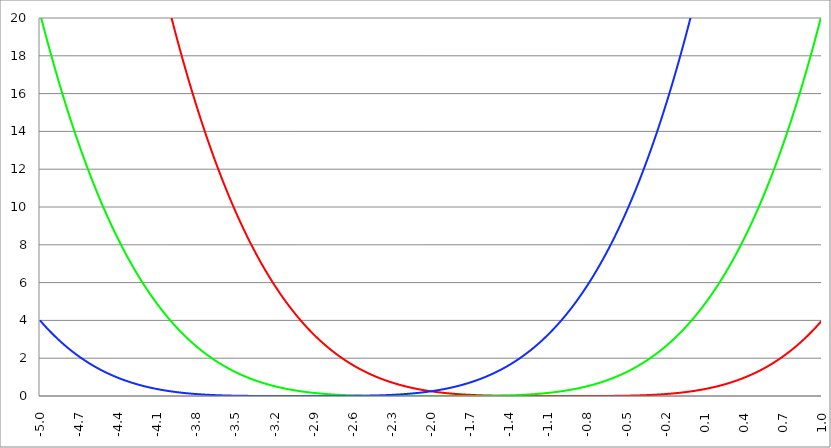
| Category | Series 1 | Series 0 | Series 2 |
|---|---|---|---|
| -5.0 | 64 | 20.25 | 4 |
| -4.997 | 63.808 | 20.169 | 3.976 |
| -4.994 | 63.617 | 20.088 | 3.952 |
| -4.991 | 63.426 | 20.008 | 3.928 |
| -4.988 | 63.235 | 19.928 | 3.905 |
| -4.984999999999999 | 63.045 | 19.848 | 3.881 |
| -4.982 | 62.856 | 19.768 | 3.858 |
| -4.979 | 62.667 | 19.689 | 3.835 |
| -4.976 | 62.478 | 19.61 | 3.811 |
| -4.972999999999999 | 62.289 | 19.531 | 3.788 |
| -4.969999999999999 | 62.101 | 19.452 | 3.765 |
| -4.966999999999999 | 61.914 | 19.374 | 3.742 |
| -4.963999999999999 | 61.727 | 19.295 | 3.72 |
| -4.960999999999998 | 61.54 | 19.217 | 3.697 |
| -4.957999999999998 | 61.354 | 19.14 | 3.674 |
| -4.954999999999998 | 61.168 | 19.062 | 3.652 |
| -4.951999999999998 | 60.983 | 18.985 | 3.63 |
| -4.948999999999998 | 60.798 | 18.908 | 3.607 |
| -4.945999999999998 | 60.613 | 18.831 | 3.585 |
| -4.942999999999998 | 60.429 | 18.754 | 3.563 |
| -4.939999999999997 | 60.246 | 18.678 | 3.541 |
| -4.936999999999997 | 60.062 | 18.602 | 3.519 |
| -4.933999999999997 | 59.879 | 18.526 | 3.498 |
| -4.930999999999997 | 59.697 | 18.45 | 3.476 |
| -4.927999999999997 | 59.515 | 18.375 | 3.454 |
| -4.924999999999997 | 59.333 | 18.3 | 3.433 |
| -4.921999999999997 | 59.152 | 18.225 | 3.412 |
| -4.918999999999997 | 58.971 | 18.15 | 3.39 |
| -4.915999999999997 | 58.791 | 18.075 | 3.369 |
| -4.912999999999997 | 58.611 | 18.001 | 3.348 |
| -4.909999999999996 | 58.432 | 17.927 | 3.327 |
| -4.906999999999996 | 58.252 | 17.853 | 3.306 |
| -4.903999999999996 | 58.074 | 17.78 | 3.286 |
| -4.900999999999996 | 57.895 | 17.706 | 3.265 |
| -4.897999999999996 | 57.717 | 17.633 | 3.244 |
| -4.894999999999996 | 57.54 | 17.56 | 3.224 |
| -4.891999999999996 | 57.363 | 17.488 | 3.203 |
| -4.888999999999996 | 57.186 | 17.415 | 3.183 |
| -4.885999999999996 | 57.01 | 17.343 | 3.163 |
| -4.882999999999996 | 56.834 | 17.271 | 3.143 |
| -4.879999999999995 | 56.659 | 17.199 | 3.123 |
| -4.876999999999995 | 56.484 | 17.128 | 3.103 |
| -4.873999999999995 | 56.309 | 17.056 | 3.083 |
| -4.870999999999995 | 56.135 | 16.985 | 3.064 |
| -4.867999999999995 | 55.961 | 16.914 | 3.044 |
| -4.864999999999995 | 55.788 | 16.844 | 3.025 |
| -4.861999999999995 | 55.615 | 16.773 | 3.005 |
| -4.858999999999995 | 55.442 | 16.703 | 2.986 |
| -4.855999999999994 | 55.27 | 16.633 | 2.967 |
| -4.852999999999994 | 55.098 | 16.563 | 2.947 |
| -4.849999999999994 | 54.927 | 16.494 | 2.928 |
| -4.846999999999994 | 54.756 | 16.424 | 2.909 |
| -4.843999999999994 | 54.585 | 16.355 | 2.891 |
| -4.840999999999994 | 54.415 | 16.286 | 2.872 |
| -4.837999999999994 | 54.245 | 16.218 | 2.853 |
| -4.834999999999994 | 54.076 | 16.149 | 2.835 |
| -4.831999999999994 | 53.907 | 16.081 | 2.816 |
| -4.828999999999993 | 53.738 | 16.013 | 2.798 |
| -4.825999999999993 | 53.57 | 15.945 | 2.779 |
| -4.822999999999993 | 53.402 | 15.878 | 2.761 |
| -4.819999999999993 | 53.235 | 15.81 | 2.743 |
| -4.816999999999993 | 53.068 | 15.743 | 2.725 |
| -4.813999999999993 | 52.901 | 15.676 | 2.707 |
| -4.810999999999993 | 52.735 | 15.609 | 2.689 |
| -4.807999999999993 | 52.569 | 15.543 | 2.671 |
| -4.804999999999993 | 52.403 | 15.476 | 2.654 |
| -4.801999999999992 | 52.238 | 15.41 | 2.636 |
| -4.798999999999992 | 52.074 | 15.344 | 2.619 |
| -4.795999999999992 | 51.909 | 15.279 | 2.601 |
| -4.792999999999992 | 51.745 | 15.213 | 2.584 |
| -4.789999999999992 | 51.582 | 15.148 | 2.567 |
| -4.786999999999992 | 51.419 | 15.083 | 2.549 |
| -4.783999999999992 | 51.256 | 15.018 | 2.532 |
| -4.780999999999992 | 51.094 | 14.954 | 2.515 |
| -4.777999999999992 | 50.932 | 14.889 | 2.498 |
| -4.774999999999991 | 50.77 | 14.825 | 2.482 |
| -4.771999999999991 | 50.609 | 14.761 | 2.465 |
| -4.768999999999991 | 50.448 | 14.697 | 2.448 |
| -4.765999999999991 | 50.288 | 14.634 | 2.432 |
| -4.762999999999991 | 50.128 | 14.57 | 2.415 |
| -4.759999999999991 | 49.968 | 14.507 | 2.399 |
| -4.756999999999991 | 49.809 | 14.444 | 2.382 |
| -4.753999999999991 | 49.65 | 14.381 | 2.366 |
| -4.75099999999999 | 49.491 | 14.319 | 2.35 |
| -4.74799999999999 | 49.333 | 14.256 | 2.334 |
| -4.74499999999999 | 49.175 | 14.194 | 2.318 |
| -4.74199999999999 | 49.018 | 14.132 | 2.302 |
| -4.73899999999999 | 48.861 | 14.07 | 2.286 |
| -4.73599999999999 | 48.704 | 14.009 | 2.271 |
| -4.73299999999999 | 48.548 | 13.948 | 2.255 |
| -4.72999999999999 | 48.392 | 13.886 | 2.239 |
| -4.72699999999999 | 48.237 | 13.825 | 2.224 |
| -4.723999999999989 | 48.082 | 13.765 | 2.208 |
| -4.720999999999989 | 47.927 | 13.704 | 2.193 |
| -4.717999999999989 | 47.772 | 13.644 | 2.178 |
| -4.714999999999989 | 47.618 | 13.584 | 2.163 |
| -4.71199999999999 | 47.465 | 13.524 | 2.148 |
| -4.708999999999989 | 47.312 | 13.464 | 2.133 |
| -4.705999999999989 | 47.159 | 13.405 | 2.118 |
| -4.702999999999989 | 47.006 | 13.345 | 2.103 |
| -4.699999999999989 | 46.854 | 13.286 | 2.088 |
| -4.696999999999988 | 46.702 | 13.227 | 2.073 |
| -4.693999999999988 | 46.551 | 13.168 | 2.059 |
| -4.690999999999988 | 46.4 | 13.11 | 2.044 |
| -4.687999999999988 | 46.249 | 13.051 | 2.03 |
| -4.684999999999988 | 46.099 | 12.993 | 2.015 |
| -4.681999999999988 | 45.949 | 12.935 | 2.001 |
| -4.678999999999988 | 45.799 | 12.877 | 1.987 |
| -4.675999999999988 | 45.65 | 12.82 | 1.973 |
| -4.672999999999988 | 45.501 | 12.763 | 1.959 |
| -4.669999999999987 | 45.353 | 12.705 | 1.944 |
| -4.666999999999987 | 45.205 | 12.648 | 1.931 |
| -4.663999999999987 | 45.057 | 12.591 | 1.917 |
| -4.660999999999987 | 44.91 | 12.535 | 1.903 |
| -4.657999999999987 | 44.763 | 12.478 | 1.889 |
| -4.654999999999987 | 44.616 | 12.422 | 1.876 |
| -4.651999999999987 | 44.47 | 12.366 | 1.862 |
| -4.648999999999987 | 44.324 | 12.31 | 1.849 |
| -4.645999999999986 | 44.178 | 12.255 | 1.835 |
| -4.642999999999986 | 44.033 | 12.199 | 1.822 |
| -4.639999999999986 | 43.888 | 12.144 | 1.808 |
| -4.636999999999986 | 43.743 | 12.089 | 1.795 |
| -4.633999999999986 | 43.599 | 12.034 | 1.782 |
| -4.630999999999986 | 43.456 | 11.979 | 1.769 |
| -4.627999999999986 | 43.312 | 11.925 | 1.756 |
| -4.624999999999986 | 43.169 | 11.87 | 1.743 |
| -4.621999999999986 | 43.026 | 11.816 | 1.73 |
| -4.618999999999985 | 42.884 | 11.762 | 1.718 |
| -4.615999999999985 | 42.742 | 11.708 | 1.705 |
| -4.612999999999985 | 42.6 | 11.655 | 1.692 |
| -4.609999999999985 | 42.459 | 11.601 | 1.68 |
| -4.606999999999985 | 42.318 | 11.548 | 1.667 |
| -4.603999999999985 | 42.177 | 11.495 | 1.655 |
| -4.600999999999985 | 42.037 | 11.442 | 1.642 |
| -4.597999999999985 | 41.897 | 11.389 | 1.63 |
| -4.594999999999985 | 41.758 | 11.337 | 1.618 |
| -4.591999999999984 | 41.618 | 11.284 | 1.606 |
| -4.588999999999984 | 41.48 | 11.232 | 1.594 |
| -4.585999999999984 | 41.341 | 11.18 | 1.582 |
| -4.582999999999984 | 41.203 | 11.129 | 1.57 |
| -4.579999999999984 | 41.065 | 11.077 | 1.558 |
| -4.576999999999984 | 40.928 | 11.025 | 1.546 |
| -4.573999999999984 | 40.79 | 10.974 | 1.534 |
| -4.570999999999984 | 40.654 | 10.923 | 1.523 |
| -4.567999999999984 | 40.517 | 10.872 | 1.511 |
| -4.564999999999984 | 40.381 | 10.822 | 1.5 |
| -4.561999999999983 | 40.245 | 10.771 | 1.488 |
| -4.558999999999983 | 40.11 | 10.721 | 1.477 |
| -4.555999999999983 | 39.975 | 10.67 | 1.465 |
| -4.552999999999983 | 39.84 | 10.62 | 1.454 |
| -4.549999999999983 | 39.706 | 10.571 | 1.443 |
| -4.546999999999983 | 39.572 | 10.521 | 1.432 |
| -4.543999999999983 | 39.438 | 10.471 | 1.421 |
| -4.540999999999983 | 39.305 | 10.422 | 1.41 |
| -4.537999999999982 | 39.172 | 10.373 | 1.399 |
| -4.534999999999982 | 39.039 | 10.324 | 1.388 |
| -4.531999999999982 | 38.907 | 10.275 | 1.377 |
| -4.528999999999982 | 38.775 | 10.227 | 1.366 |
| -4.525999999999982 | 38.643 | 10.178 | 1.356 |
| -4.522999999999982 | 38.512 | 10.13 | 1.345 |
| -4.519999999999982 | 38.381 | 10.082 | 1.334 |
| -4.516999999999982 | 38.25 | 10.034 | 1.324 |
| -4.513999999999982 | 38.119 | 9.986 | 1.314 |
| -4.510999999999981 | 37.989 | 9.939 | 1.303 |
| -4.507999999999981 | 37.86 | 9.891 | 1.293 |
| -4.504999999999981 | 37.73 | 9.844 | 1.283 |
| -4.501999999999981 | 37.601 | 9.797 | 1.272 |
| -4.498999999999981 | 37.473 | 9.75 | 1.262 |
| -4.495999999999981 | 37.344 | 9.703 | 1.252 |
| -4.492999999999981 | 37.216 | 9.657 | 1.242 |
| -4.48999999999998 | 37.089 | 9.61 | 1.232 |
| -4.48699999999998 | 36.961 | 9.564 | 1.222 |
| -4.48399999999998 | 36.834 | 9.518 | 1.212 |
| -4.48099999999998 | 36.708 | 9.472 | 1.203 |
| -4.47799999999998 | 36.581 | 9.426 | 1.193 |
| -4.47499999999998 | 36.455 | 9.381 | 1.183 |
| -4.47199999999998 | 36.329 | 9.335 | 1.174 |
| -4.46899999999998 | 36.204 | 9.29 | 1.164 |
| -4.46599999999998 | 36.079 | 9.245 | 1.155 |
| -4.46299999999998 | 35.954 | 9.2 | 1.145 |
| -4.45999999999998 | 35.83 | 9.155 | 1.136 |
| -4.45699999999998 | 35.706 | 9.111 | 1.127 |
| -4.45399999999998 | 35.582 | 9.066 | 1.117 |
| -4.45099999999998 | 35.458 | 9.022 | 1.108 |
| -4.44799999999998 | 35.335 | 8.978 | 1.099 |
| -4.444999999999979 | 35.213 | 8.934 | 1.09 |
| -4.441999999999978 | 35.09 | 8.89 | 1.081 |
| -4.438999999999978 | 34.968 | 8.847 | 1.072 |
| -4.435999999999978 | 34.846 | 8.803 | 1.063 |
| -4.432999999999978 | 34.724 | 8.76 | 1.054 |
| -4.429999999999978 | 34.603 | 8.717 | 1.045 |
| -4.426999999999978 | 34.482 | 8.674 | 1.037 |
| -4.423999999999978 | 34.362 | 8.631 | 1.028 |
| -4.420999999999978 | 34.241 | 8.589 | 1.019 |
| -4.417999999999978 | 34.122 | 8.546 | 1.011 |
| -4.414999999999978 | 34.002 | 8.504 | 1.002 |
| -4.411999999999977 | 33.883 | 8.462 | 0.994 |
| -4.408999999999977 | 33.764 | 8.42 | 0.985 |
| -4.405999999999977 | 33.645 | 8.378 | 0.977 |
| -4.402999999999977 | 33.526 | 8.336 | 0.969 |
| -4.399999999999977 | 33.408 | 8.294 | 0.96 |
| -4.396999999999977 | 33.291 | 8.253 | 0.952 |
| -4.393999999999977 | 33.173 | 8.212 | 0.944 |
| -4.390999999999977 | 33.056 | 8.171 | 0.936 |
| -4.387999999999977 | 32.939 | 8.13 | 0.928 |
| -4.384999999999977 | 32.823 | 8.089 | 0.92 |
| -4.381999999999976 | 32.707 | 8.048 | 0.912 |
| -4.378999999999976 | 32.591 | 8.008 | 0.904 |
| -4.375999999999976 | 32.475 | 7.968 | 0.896 |
| -4.372999999999976 | 32.36 | 7.927 | 0.888 |
| -4.369999999999976 | 32.245 | 7.887 | 0.881 |
| -4.366999999999976 | 32.13 | 7.848 | 0.873 |
| -4.363999999999976 | 32.016 | 7.808 | 0.865 |
| -4.360999999999976 | 31.902 | 7.768 | 0.858 |
| -4.357999999999976 | 31.788 | 7.729 | 0.85 |
| -4.354999999999976 | 31.675 | 7.69 | 0.843 |
| -4.351999999999975 | 31.561 | 7.65 | 0.835 |
| -4.348999999999975 | 31.449 | 7.612 | 0.828 |
| -4.345999999999975 | 31.336 | 7.573 | 0.821 |
| -4.342999999999975 | 31.224 | 7.534 | 0.813 |
| -4.339999999999974 | 31.112 | 7.496 | 0.806 |
| -4.336999999999974 | 31 | 7.457 | 0.799 |
| -4.333999999999974 | 30.889 | 7.419 | 0.792 |
| -4.330999999999974 | 30.778 | 7.381 | 0.785 |
| -4.327999999999974 | 30.667 | 7.343 | 0.778 |
| -4.324999999999974 | 30.557 | 7.305 | 0.771 |
| -4.321999999999974 | 30.447 | 7.268 | 0.764 |
| -4.318999999999974 | 30.337 | 7.23 | 0.757 |
| -4.315999999999974 | 30.227 | 7.193 | 0.75 |
| -4.312999999999974 | 30.118 | 7.156 | 0.743 |
| -4.309999999999974 | 30.009 | 7.118 | 0.736 |
| -4.306999999999974 | 29.9 | 7.082 | 0.73 |
| -4.303999999999974 | 29.792 | 7.045 | 0.723 |
| -4.300999999999973 | 29.684 | 7.008 | 0.716 |
| -4.297999999999973 | 29.576 | 6.972 | 0.71 |
| -4.294999999999973 | 29.469 | 6.935 | 0.703 |
| -4.291999999999973 | 29.362 | 6.899 | 0.697 |
| -4.288999999999973 | 29.255 | 6.863 | 0.69 |
| -4.285999999999973 | 29.148 | 6.827 | 0.684 |
| -4.282999999999973 | 29.042 | 6.791 | 0.677 |
| -4.279999999999972 | 28.936 | 6.756 | 0.671 |
| -4.276999999999972 | 28.83 | 6.72 | 0.665 |
| -4.273999999999972 | 28.725 | 6.685 | 0.659 |
| -4.270999999999972 | 28.62 | 6.65 | 0.652 |
| -4.267999999999972 | 28.515 | 6.615 | 0.646 |
| -4.264999999999972 | 28.41 | 6.58 | 0.64 |
| -4.261999999999972 | 28.306 | 6.545 | 0.634 |
| -4.258999999999972 | 28.202 | 6.51 | 0.628 |
| -4.255999999999972 | 28.098 | 6.476 | 0.622 |
| -4.252999999999972 | 27.995 | 6.441 | 0.616 |
| -4.249999999999971 | 27.892 | 6.407 | 0.61 |
| -4.246999999999971 | 27.789 | 6.373 | 0.605 |
| -4.243999999999971 | 27.686 | 6.339 | 0.599 |
| -4.240999999999971 | 27.584 | 6.305 | 0.593 |
| -4.237999999999971 | 27.482 | 6.272 | 0.587 |
| -4.234999999999971 | 27.38 | 6.238 | 0.582 |
| -4.23199999999997 | 27.279 | 6.205 | 0.576 |
| -4.228999999999971 | 27.178 | 6.171 | 0.57 |
| -4.225999999999971 | 27.077 | 6.138 | 0.565 |
| -4.222999999999971 | 26.976 | 6.105 | 0.559 |
| -4.21999999999997 | 26.876 | 6.072 | 0.554 |
| -4.21699999999997 | 26.776 | 6.04 | 0.548 |
| -4.21399999999997 | 26.676 | 6.007 | 0.543 |
| -4.21099999999997 | 26.577 | 5.974 | 0.538 |
| -4.20799999999997 | 26.478 | 5.942 | 0.532 |
| -4.20499999999997 | 26.379 | 5.91 | 0.527 |
| -4.20199999999997 | 26.28 | 5.878 | 0.522 |
| -4.19899999999997 | 26.182 | 5.846 | 0.517 |
| -4.19599999999997 | 26.084 | 5.814 | 0.512 |
| -4.192999999999969 | 25.986 | 5.782 | 0.506 |
| -4.18999999999997 | 25.888 | 5.751 | 0.501 |
| -4.18699999999997 | 25.791 | 5.719 | 0.496 |
| -4.18399999999997 | 25.694 | 5.688 | 0.491 |
| -4.180999999999969 | 25.597 | 5.657 | 0.486 |
| -4.177999999999969 | 25.501 | 5.626 | 0.481 |
| -4.174999999999969 | 25.405 | 5.595 | 0.477 |
| -4.171999999999968 | 25.309 | 5.564 | 0.472 |
| -4.168999999999968 | 25.213 | 5.533 | 0.467 |
| -4.165999999999968 | 25.118 | 5.503 | 0.462 |
| -4.162999999999968 | 25.023 | 5.472 | 0.457 |
| -4.159999999999968 | 24.928 | 5.442 | 0.453 |
| -4.156999999999968 | 24.834 | 5.412 | 0.448 |
| -4.153999999999968 | 24.739 | 5.382 | 0.443 |
| -4.150999999999968 | 24.645 | 5.352 | 0.439 |
| -4.147999999999968 | 24.552 | 5.322 | 0.434 |
| -4.144999999999968 | 24.458 | 5.292 | 0.43 |
| -4.141999999999967 | 24.365 | 5.263 | 0.425 |
| -4.138999999999967 | 24.272 | 5.233 | 0.421 |
| -4.135999999999967 | 24.179 | 5.204 | 0.416 |
| -4.132999999999967 | 24.087 | 5.175 | 0.412 |
| -4.129999999999967 | 23.995 | 5.146 | 0.408 |
| -4.126999999999967 | 23.903 | 5.117 | 0.403 |
| -4.123999999999967 | 23.811 | 5.088 | 0.399 |
| -4.120999999999967 | 23.72 | 5.059 | 0.395 |
| -4.117999999999967 | 23.629 | 5.031 | 0.391 |
| -4.114999999999966 | 23.538 | 5.002 | 0.386 |
| -4.111999999999966 | 23.448 | 4.974 | 0.382 |
| -4.108999999999966 | 23.357 | 4.946 | 0.378 |
| -4.105999999999966 | 23.267 | 4.918 | 0.374 |
| -4.102999999999966 | 23.178 | 4.89 | 0.37 |
| -4.099999999999965 | 23.088 | 4.862 | 0.366 |
| -4.096999999999965 | 22.999 | 4.834 | 0.362 |
| -4.093999999999965 | 22.91 | 4.807 | 0.358 |
| -4.090999999999965 | 22.821 | 4.779 | 0.354 |
| -4.087999999999965 | 22.733 | 4.752 | 0.35 |
| -4.084999999999965 | 22.644 | 4.725 | 0.346 |
| -4.081999999999965 | 22.556 | 4.697 | 0.343 |
| -4.078999999999965 | 22.469 | 4.67 | 0.339 |
| -4.075999999999964 | 22.381 | 4.644 | 0.335 |
| -4.072999999999964 | 22.294 | 4.617 | 0.331 |
| -4.069999999999964 | 22.207 | 4.59 | 0.328 |
| -4.066999999999964 | 22.121 | 4.564 | 0.324 |
| -4.063999999999964 | 22.034 | 4.537 | 0.32 |
| -4.060999999999964 | 21.948 | 4.511 | 0.317 |
| -4.057999999999964 | 21.862 | 4.485 | 0.313 |
| -4.054999999999964 | 21.776 | 4.458 | 0.31 |
| -4.051999999999964 | 21.691 | 4.433 | 0.306 |
| -4.048999999999964 | 21.606 | 4.407 | 0.303 |
| -4.045999999999964 | 21.521 | 4.381 | 0.299 |
| -4.042999999999964 | 21.436 | 4.355 | 0.296 |
| -4.039999999999963 | 21.352 | 4.33 | 0.292 |
| -4.036999999999963 | 21.268 | 4.304 | 0.289 |
| -4.033999999999963 | 21.184 | 4.279 | 0.286 |
| -4.030999999999963 | 21.1 | 4.254 | 0.282 |
| -4.027999999999963 | 21.017 | 4.229 | 0.279 |
| -4.024999999999963 | 20.933 | 4.204 | 0.276 |
| -4.021999999999963 | 20.851 | 4.179 | 0.273 |
| -4.018999999999963 | 20.768 | 4.154 | 0.27 |
| -4.015999999999963 | 20.685 | 4.13 | 0.266 |
| -4.012999999999963 | 20.603 | 4.105 | 0.263 |
| -4.009999999999962 | 20.521 | 4.081 | 0.26 |
| -4.006999999999962 | 20.44 | 4.056 | 0.257 |
| -4.003999999999962 | 20.358 | 4.032 | 0.254 |
| -4.000999999999962 | 20.277 | 4.008 | 0.251 |
| -3.997999999999962 | 20.196 | 3.984 | 0.248 |
| -3.994999999999962 | 20.115 | 3.96 | 0.245 |
| -3.991999999999962 | 20.035 | 3.936 | 0.242 |
| -3.988999999999962 | 19.955 | 3.913 | 0.239 |
| -3.985999999999962 | 19.875 | 3.889 | 0.236 |
| -3.982999999999961 | 19.795 | 3.866 | 0.233 |
| -3.979999999999961 | 19.715 | 3.842 | 0.231 |
| -3.976999999999961 | 19.636 | 3.819 | 0.228 |
| -3.973999999999961 | 19.557 | 3.796 | 0.225 |
| -3.970999999999961 | 19.478 | 3.773 | 0.222 |
| -3.967999999999961 | 19.4 | 3.75 | 0.22 |
| -3.964999999999961 | 19.321 | 3.727 | 0.217 |
| -3.961999999999961 | 19.243 | 3.705 | 0.214 |
| -3.958999999999961 | 19.165 | 3.682 | 0.211 |
| -3.95599999999996 | 19.088 | 3.659 | 0.209 |
| -3.95299999999996 | 19.011 | 3.637 | 0.206 |
| -3.94999999999996 | 18.933 | 3.615 | 0.204 |
| -3.94699999999996 | 18.856 | 3.593 | 0.201 |
| -3.94399999999996 | 18.78 | 3.57 | 0.199 |
| -3.94099999999996 | 18.703 | 3.548 | 0.196 |
| -3.93799999999996 | 18.627 | 3.527 | 0.194 |
| -3.93499999999996 | 18.551 | 3.505 | 0.191 |
| -3.931999999999959 | 18.475 | 3.483 | 0.189 |
| -3.928999999999959 | 18.4 | 3.462 | 0.186 |
| -3.925999999999959 | 18.325 | 3.44 | 0.184 |
| -3.922999999999959 | 18.25 | 3.419 | 0.181 |
| -3.919999999999959 | 18.175 | 3.397 | 0.179 |
| -3.916999999999959 | 18.1 | 3.376 | 0.177 |
| -3.913999999999959 | 18.026 | 3.355 | 0.174 |
| -3.910999999999959 | 17.952 | 3.334 | 0.172 |
| -3.907999999999959 | 17.878 | 3.313 | 0.17 |
| -3.904999999999958 | 17.804 | 3.292 | 0.168 |
| -3.901999999999958 | 17.731 | 3.272 | 0.165 |
| -3.898999999999958 | 17.658 | 3.251 | 0.163 |
| -3.895999999999958 | 17.585 | 3.231 | 0.161 |
| -3.892999999999958 | 17.512 | 3.21 | 0.159 |
| -3.889999999999958 | 17.439 | 3.19 | 0.157 |
| -3.886999999999958 | 17.367 | 3.17 | 0.155 |
| -3.883999999999958 | 17.295 | 3.15 | 0.153 |
| -3.880999999999958 | 17.223 | 3.13 | 0.151 |
| -3.877999999999957 | 17.152 | 3.11 | 0.149 |
| -3.874999999999957 | 17.08 | 3.09 | 0.147 |
| -3.871999999999957 | 17.009 | 3.07 | 0.145 |
| -3.868999999999957 | 16.938 | 3.051 | 0.143 |
| -3.865999999999957 | 16.867 | 3.031 | 0.141 |
| -3.862999999999957 | 16.797 | 3.012 | 0.139 |
| -3.859999999999957 | 16.726 | 2.992 | 0.137 |
| -3.856999999999957 | 16.656 | 2.973 | 0.135 |
| -3.853999999999957 | 16.587 | 2.954 | 0.133 |
| -3.850999999999956 | 16.517 | 2.935 | 0.131 |
| -3.847999999999956 | 16.448 | 2.916 | 0.129 |
| -3.844999999999956 | 16.378 | 2.897 | 0.127 |
| -3.841999999999956 | 16.309 | 2.878 | 0.126 |
| -3.838999999999956 | 16.241 | 2.859 | 0.124 |
| -3.835999999999956 | 16.172 | 2.841 | 0.122 |
| -3.832999999999956 | 16.104 | 2.822 | 0.12 |
| -3.829999999999956 | 16.036 | 2.804 | 0.119 |
| -3.826999999999955 | 15.968 | 2.785 | 0.117 |
| -3.823999999999955 | 15.9 | 2.767 | 0.115 |
| -3.820999999999955 | 15.833 | 2.749 | 0.114 |
| -3.817999999999955 | 15.765 | 2.731 | 0.112 |
| -3.814999999999955 | 15.698 | 2.713 | 0.11 |
| -3.811999999999955 | 15.632 | 2.695 | 0.109 |
| -3.808999999999955 | 15.565 | 2.677 | 0.107 |
| -3.805999999999955 | 15.499 | 2.66 | 0.106 |
| -3.802999999999955 | 15.432 | 2.642 | 0.104 |
| -3.799999999999954 | 15.366 | 2.624 | 0.102 |
| -3.796999999999954 | 15.301 | 2.607 | 0.101 |
| -3.793999999999954 | 15.235 | 2.59 | 0.099 |
| -3.790999999999954 | 15.17 | 2.572 | 0.098 |
| -3.787999999999954 | 15.105 | 2.555 | 0.096 |
| -3.784999999999954 | 15.04 | 2.538 | 0.095 |
| -3.781999999999954 | 14.975 | 2.521 | 0.093 |
| -3.778999999999954 | 14.911 | 2.504 | 0.092 |
| -3.775999999999954 | 14.846 | 2.487 | 0.091 |
| -3.772999999999953 | 14.782 | 2.47 | 0.089 |
| -3.769999999999953 | 14.718 | 2.454 | 0.088 |
| -3.766999999999953 | 14.655 | 2.437 | 0.087 |
| -3.763999999999953 | 14.591 | 2.421 | 0.085 |
| -3.760999999999953 | 14.528 | 2.404 | 0.084 |
| -3.757999999999953 | 14.465 | 2.388 | 0.083 |
| -3.754999999999953 | 14.402 | 2.372 | 0.081 |
| -3.751999999999953 | 14.339 | 2.355 | 0.08 |
| -3.748999999999952 | 14.277 | 2.339 | 0.079 |
| -3.745999999999952 | 14.215 | 2.323 | 0.077 |
| -3.742999999999952 | 14.153 | 2.307 | 0.076 |
| -3.739999999999952 | 14.091 | 2.292 | 0.075 |
| -3.736999999999952 | 14.029 | 2.276 | 0.074 |
| -3.733999999999952 | 13.968 | 2.26 | 0.073 |
| -3.730999999999952 | 13.907 | 2.245 | 0.071 |
| -3.727999999999952 | 13.846 | 2.229 | 0.07 |
| -3.724999999999952 | 13.785 | 2.214 | 0.069 |
| -3.721999999999951 | 13.724 | 2.198 | 0.068 |
| -3.718999999999951 | 13.664 | 2.183 | 0.067 |
| -3.715999999999951 | 13.604 | 2.168 | 0.066 |
| -3.712999999999951 | 13.544 | 2.153 | 0.065 |
| -3.709999999999951 | 13.484 | 2.138 | 0.064 |
| -3.706999999999951 | 13.424 | 2.123 | 0.062 |
| -3.703999999999951 | 13.365 | 2.108 | 0.061 |
| -3.700999999999951 | 13.306 | 2.093 | 0.06 |
| -3.697999999999951 | 13.247 | 2.078 | 0.059 |
| -3.69499999999995 | 13.188 | 2.064 | 0.058 |
| -3.69199999999995 | 13.129 | 2.049 | 0.057 |
| -3.68899999999995 | 13.071 | 2.035 | 0.056 |
| -3.68599999999995 | 13.013 | 2.02 | 0.055 |
| -3.68299999999995 | 12.955 | 2.006 | 0.054 |
| -3.67999999999995 | 12.897 | 1.991 | 0.053 |
| -3.67699999999995 | 12.839 | 1.977 | 0.053 |
| -3.67399999999995 | 12.782 | 1.963 | 0.052 |
| -3.67099999999995 | 12.724 | 1.949 | 0.051 |
| -3.667999999999949 | 12.667 | 1.935 | 0.05 |
| -3.664999999999949 | 12.61 | 1.921 | 0.049 |
| -3.661999999999949 | 12.554 | 1.907 | 0.048 |
| -3.658999999999949 | 12.497 | 1.894 | 0.047 |
| -3.655999999999949 | 12.441 | 1.88 | 0.046 |
| -3.652999999999949 | 12.385 | 1.867 | 0.045 |
| -3.649999999999949 | 12.329 | 1.853 | 0.045 |
| -3.646999999999949 | 12.273 | 1.84 | 0.044 |
| -3.643999999999949 | 12.218 | 1.826 | 0.043 |
| -3.640999999999948 | 12.162 | 1.813 | 0.042 |
| -3.637999999999948 | 12.107 | 1.8 | 0.041 |
| -3.634999999999948 | 12.052 | 1.787 | 0.041 |
| -3.631999999999948 | 11.997 | 1.773 | 0.04 |
| -3.628999999999948 | 11.943 | 1.76 | 0.039 |
| -3.625999999999948 | 11.888 | 1.748 | 0.038 |
| -3.622999999999948 | 11.834 | 1.735 | 0.038 |
| -3.619999999999948 | 11.78 | 1.722 | 0.037 |
| -3.616999999999947 | 11.726 | 1.709 | 0.036 |
| -3.613999999999947 | 11.672 | 1.697 | 0.036 |
| -3.610999999999947 | 11.619 | 1.684 | 0.035 |
| -3.607999999999947 | 11.566 | 1.671 | 0.034 |
| -3.604999999999947 | 11.513 | 1.659 | 0.033 |
| -3.601999999999947 | 11.46 | 1.647 | 0.033 |
| -3.598999999999947 | 11.407 | 1.634 | 0.032 |
| -3.595999999999947 | 11.354 | 1.622 | 0.032 |
| -3.592999999999947 | 11.302 | 1.61 | 0.031 |
| -3.589999999999947 | 11.25 | 1.598 | 0.03 |
| -3.586999999999946 | 11.198 | 1.586 | 0.03 |
| -3.583999999999946 | 11.146 | 1.574 | 0.029 |
| -3.580999999999946 | 11.094 | 1.562 | 0.028 |
| -3.577999999999946 | 11.043 | 1.55 | 0.028 |
| -3.574999999999946 | 10.991 | 1.538 | 0.027 |
| -3.571999999999946 | 10.94 | 1.527 | 0.027 |
| -3.568999999999946 | 10.889 | 1.515 | 0.026 |
| -3.565999999999946 | 10.838 | 1.504 | 0.026 |
| -3.562999999999946 | 10.788 | 1.492 | 0.025 |
| -3.559999999999945 | 10.737 | 1.481 | 0.025 |
| -3.556999999999945 | 10.687 | 1.469 | 0.024 |
| -3.553999999999945 | 10.637 | 1.458 | 0.024 |
| -3.550999999999945 | 10.587 | 1.447 | 0.023 |
| -3.547999999999945 | 10.538 | 1.436 | 0.023 |
| -3.544999999999945 | 10.488 | 1.424 | 0.022 |
| -3.541999999999945 | 10.439 | 1.413 | 0.022 |
| -3.538999999999945 | 10.389 | 1.402 | 0.021 |
| -3.535999999999945 | 10.34 | 1.392 | 0.021 |
| -3.532999999999944 | 10.292 | 1.381 | 0.02 |
| -3.529999999999944 | 10.243 | 1.37 | 0.02 |
| -3.526999999999944 | 10.194 | 1.359 | 0.019 |
| -3.523999999999944 | 10.146 | 1.349 | 0.019 |
| -3.520999999999944 | 10.098 | 1.338 | 0.018 |
| -3.517999999999944 | 10.05 | 1.327 | 0.018 |
| -3.514999999999944 | 10.002 | 1.317 | 0.018 |
| -3.511999999999944 | 9.954 | 1.307 | 0.017 |
| -3.508999999999943 | 9.907 | 1.296 | 0.017 |
| -3.505999999999943 | 9.86 | 1.286 | 0.016 |
| -3.502999999999943 | 9.813 | 1.276 | 0.016 |
| -3.499999999999943 | 9.766 | 1.266 | 0.016 |
| -3.496999999999943 | 9.719 | 1.256 | 0.015 |
| -3.493999999999943 | 9.672 | 1.245 | 0.015 |
| -3.490999999999943 | 9.626 | 1.236 | 0.015 |
| -3.487999999999943 | 9.579 | 1.226 | 0.014 |
| -3.484999999999943 | 9.533 | 1.216 | 0.014 |
| -3.481999999999942 | 9.487 | 1.206 | 0.013 |
| -3.478999999999942 | 9.442 | 1.196 | 0.013 |
| -3.475999999999942 | 9.396 | 1.187 | 0.013 |
| -3.472999999999942 | 9.351 | 1.177 | 0.013 |
| -3.469999999999942 | 9.305 | 1.167 | 0.012 |
| -3.466999999999942 | 9.26 | 1.158 | 0.012 |
| -3.463999999999942 | 9.215 | 1.148 | 0.012 |
| -3.460999999999942 | 9.17 | 1.139 | 0.011 |
| -3.457999999999942 | 9.126 | 1.13 | 0.011 |
| -3.454999999999941 | 9.081 | 1.12 | 0.011 |
| -3.451999999999941 | 9.037 | 1.111 | 0.01 |
| -3.448999999999941 | 8.993 | 1.102 | 0.01 |
| -3.445999999999941 | 8.949 | 1.093 | 0.01 |
| -3.442999999999941 | 8.905 | 1.084 | 0.01 |
| -3.439999999999941 | 8.861 | 1.075 | 0.009 |
| -3.436999999999941 | 8.818 | 1.066 | 0.009 |
| -3.433999999999941 | 8.774 | 1.057 | 0.009 |
| -3.430999999999941 | 8.731 | 1.048 | 0.009 |
| -3.42799999999994 | 8.688 | 1.04 | 0.008 |
| -3.42499999999994 | 8.645 | 1.031 | 0.008 |
| -3.42199999999994 | 8.603 | 1.022 | 0.008 |
| -3.41899999999994 | 8.56 | 1.014 | 0.008 |
| -3.41599999999994 | 8.518 | 1.005 | 0.007 |
| -3.41299999999994 | 8.476 | 0.997 | 0.007 |
| -3.40999999999994 | 8.434 | 0.988 | 0.007 |
| -3.40699999999994 | 8.392 | 0.98 | 0.007 |
| -3.403999999999939 | 8.35 | 0.971 | 0.007 |
| -3.400999999999939 | 8.308 | 0.963 | 0.006 |
| -3.397999999999939 | 8.267 | 0.955 | 0.006 |
| -3.394999999999939 | 8.225 | 0.947 | 0.006 |
| -3.391999999999939 | 8.184 | 0.939 | 0.006 |
| -3.388999999999939 | 8.143 | 0.931 | 0.006 |
| -3.385999999999939 | 8.103 | 0.923 | 0.006 |
| -3.382999999999939 | 8.062 | 0.915 | 0.005 |
| -3.379999999999939 | 8.021 | 0.907 | 0.005 |
| -3.376999999999938 | 7.981 | 0.899 | 0.005 |
| -3.373999999999938 | 7.941 | 0.891 | 0.005 |
| -3.370999999999938 | 7.901 | 0.883 | 0.005 |
| -3.367999999999938 | 7.861 | 0.876 | 0.005 |
| -3.364999999999938 | 7.821 | 0.868 | 0.004 |
| -3.361999999999938 | 7.781 | 0.86 | 0.004 |
| -3.358999999999938 | 7.742 | 0.853 | 0.004 |
| -3.355999999999938 | 7.703 | 0.845 | 0.004 |
| -3.352999999999938 | 7.664 | 0.838 | 0.004 |
| -3.349999999999937 | 7.625 | 0.83 | 0.004 |
| -3.346999999999937 | 7.586 | 0.823 | 0.004 |
| -3.343999999999937 | 7.547 | 0.816 | 0.004 |
| -3.340999999999937 | 7.508 | 0.808 | 0.003 |
| -3.337999999999937 | 7.47 | 0.801 | 0.003 |
| -3.334999999999937 | 7.432 | 0.794 | 0.003 |
| -3.331999999999937 | 7.394 | 0.787 | 0.003 |
| -3.328999999999937 | 7.356 | 0.78 | 0.003 |
| -3.325999999999937 | 7.318 | 0.773 | 0.003 |
| -3.322999999999936 | 7.28 | 0.766 | 0.003 |
| -3.319999999999936 | 7.243 | 0.759 | 0.003 |
| -3.316999999999936 | 7.205 | 0.752 | 0.003 |
| -3.313999999999936 | 7.168 | 0.745 | 0.002 |
| -3.310999999999936 | 7.131 | 0.739 | 0.002 |
| -3.307999999999936 | 7.094 | 0.732 | 0.002 |
| -3.304999999999936 | 7.057 | 0.725 | 0.002 |
| -3.301999999999936 | 7.02 | 0.718 | 0.002 |
| -3.298999999999936 | 6.984 | 0.712 | 0.002 |
| -3.295999999999935 | 6.947 | 0.705 | 0.002 |
| -3.292999999999935 | 6.911 | 0.699 | 0.002 |
| -3.289999999999935 | 6.875 | 0.692 | 0.002 |
| -3.286999999999935 | 6.839 | 0.686 | 0.002 |
| -3.283999999999935 | 6.803 | 0.68 | 0.002 |
| -3.280999999999935 | 6.768 | 0.673 | 0.002 |
| -3.277999999999935 | 6.732 | 0.667 | 0.001 |
| -3.274999999999935 | 6.697 | 0.661 | 0.001 |
| -3.271999999999934 | 6.662 | 0.654 | 0.001 |
| -3.268999999999934 | 6.626 | 0.648 | 0.001 |
| -3.265999999999934 | 6.591 | 0.642 | 0.001 |
| -3.262999999999934 | 6.557 | 0.636 | 0.001 |
| -3.259999999999934 | 6.522 | 0.63 | 0.001 |
| -3.256999999999934 | 6.487 | 0.624 | 0.001 |
| -3.253999999999934 | 6.453 | 0.618 | 0.001 |
| -3.250999999999934 | 6.419 | 0.612 | 0.001 |
| -3.247999999999933 | 6.384 | 0.606 | 0.001 |
| -3.244999999999933 | 6.35 | 0.601 | 0.001 |
| -3.241999999999933 | 6.317 | 0.595 | 0.001 |
| -3.238999999999933 | 6.283 | 0.589 | 0.001 |
| -3.235999999999933 | 6.249 | 0.583 | 0.001 |
| -3.232999999999933 | 6.216 | 0.578 | 0.001 |
| -3.229999999999933 | 6.182 | 0.572 | 0.001 |
| -3.226999999999933 | 6.149 | 0.567 | 0.001 |
| -3.223999999999932 | 6.116 | 0.561 | 0.001 |
| -3.220999999999932 | 6.083 | 0.556 | 0.001 |
| -3.217999999999932 | 6.05 | 0.55 | 0.001 |
| -3.214999999999932 | 6.018 | 0.545 | 0.001 |
| -3.211999999999932 | 5.985 | 0.539 | 0.001 |
| -3.208999999999932 | 5.953 | 0.534 | 0 |
| -3.205999999999932 | 5.921 | 0.529 | 0 |
| -3.202999999999932 | 5.888 | 0.524 | 0 |
| -3.199999999999932 | 5.856 | 0.518 | 0 |
| -3.196999999999932 | 5.825 | 0.513 | 0 |
| -3.193999999999932 | 5.793 | 0.508 | 0 |
| -3.190999999999931 | 5.761 | 0.503 | 0 |
| -3.187999999999931 | 5.73 | 0.498 | 0 |
| -3.184999999999931 | 5.698 | 0.493 | 0 |
| -3.181999999999931 | 5.667 | 0.488 | 0 |
| -3.178999999999931 | 5.636 | 0.483 | 0 |
| -3.175999999999931 | 5.605 | 0.478 | 0 |
| -3.172999999999931 | 5.574 | 0.473 | 0 |
| -3.169999999999931 | 5.543 | 0.468 | 0 |
| -3.166999999999931 | 5.513 | 0.464 | 0 |
| -3.16399999999993 | 5.482 | 0.459 | 0 |
| -3.16099999999993 | 5.452 | 0.454 | 0 |
| -3.15799999999993 | 5.422 | 0.45 | 0 |
| -3.15499999999993 | 5.392 | 0.445 | 0 |
| -3.15199999999993 | 5.362 | 0.44 | 0 |
| -3.14899999999993 | 5.332 | 0.436 | 0 |
| -3.14599999999993 | 5.302 | 0.431 | 0 |
| -3.14299999999993 | 5.273 | 0.427 | 0 |
| -3.139999999999929 | 5.243 | 0.422 | 0 |
| -3.136999999999929 | 5.214 | 0.418 | 0 |
| -3.133999999999929 | 5.185 | 0.413 | 0 |
| -3.130999999999929 | 5.156 | 0.409 | 0 |
| -3.12799999999993 | 5.127 | 0.405 | 0 |
| -3.124999999999929 | 5.098 | 0.4 | 0 |
| -3.121999999999929 | 5.069 | 0.396 | 0 |
| -3.118999999999929 | 5.04 | 0.392 | 0 |
| -3.115999999999929 | 5.012 | 0.388 | 0 |
| -3.112999999999928 | 4.984 | 0.384 | 0 |
| -3.109999999999928 | 4.955 | 0.38 | 0 |
| -3.106999999999928 | 4.927 | 0.375 | 0 |
| -3.103999999999928 | 4.899 | 0.371 | 0 |
| -3.100999999999928 | 4.871 | 0.367 | 0 |
| -3.097999999999928 | 4.844 | 0.363 | 0 |
| -3.094999999999928 | 4.816 | 0.359 | 0 |
| -3.091999999999928 | 4.788 | 0.355 | 0 |
| -3.088999999999928 | 4.761 | 0.352 | 0 |
| -3.085999999999927 | 4.734 | 0.348 | 0 |
| -3.082999999999927 | 4.706 | 0.344 | 0 |
| -3.079999999999927 | 4.679 | 0.34 | 0 |
| -3.076999999999927 | 4.652 | 0.336 | 0 |
| -3.073999999999927 | 4.626 | 0.333 | 0 |
| -3.070999999999927 | 4.599 | 0.329 | 0 |
| -3.067999999999927 | 4.572 | 0.325 | 0 |
| -3.064999999999927 | 4.546 | 0.322 | 0 |
| -3.061999999999927 | 4.52 | 0.318 | 0 |
| -3.058999999999926 | 4.493 | 0.314 | 0 |
| -3.055999999999926 | 4.467 | 0.311 | 0 |
| -3.052999999999926 | 4.441 | 0.307 | 0 |
| -3.049999999999926 | 4.415 | 0.304 | 0 |
| -3.046999999999926 | 4.389 | 0.3 | 0 |
| -3.043999999999926 | 4.364 | 0.297 | 0 |
| -3.040999999999926 | 4.338 | 0.294 | 0 |
| -3.037999999999926 | 4.313 | 0.29 | 0 |
| -3.034999999999926 | 4.287 | 0.287 | 0 |
| -3.031999999999925 | 4.262 | 0.284 | 0 |
| -3.028999999999925 | 4.237 | 0.28 | 0 |
| -3.025999999999925 | 4.212 | 0.277 | 0 |
| -3.022999999999925 | 4.187 | 0.274 | 0 |
| -3.019999999999925 | 4.162 | 0.271 | 0 |
| -3.016999999999925 | 4.138 | 0.267 | 0 |
| -3.013999999999925 | 4.113 | 0.264 | 0 |
| -3.010999999999925 | 4.089 | 0.261 | 0 |
| -3.007999999999925 | 4.064 | 0.258 | 0 |
| -3.004999999999924 | 4.04 | 0.255 | 0 |
| -3.001999999999924 | 4.016 | 0.252 | 0 |
| -2.998999999999924 | 3.992 | 0.249 | 0 |
| -2.995999999999924 | 3.968 | 0.246 | 0 |
| -2.992999999999924 | 3.944 | 0.243 | 0 |
| -2.989999999999924 | 3.921 | 0.24 | 0 |
| -2.986999999999924 | 3.897 | 0.237 | 0 |
| -2.983999999999924 | 3.874 | 0.234 | 0 |
| -2.980999999999923 | 3.85 | 0.232 | 0 |
| -2.977999999999923 | 3.827 | 0.229 | 0 |
| -2.974999999999923 | 3.804 | 0.226 | 0 |
| -2.971999999999923 | 3.781 | 0.223 | 0 |
| -2.968999999999923 | 3.758 | 0.22 | 0 |
| -2.965999999999923 | 3.735 | 0.218 | 0 |
| -2.962999999999923 | 3.712 | 0.215 | 0 |
| -2.959999999999923 | 3.689 | 0.212 | 0 |
| -2.956999999999923 | 3.667 | 0.21 | 0 |
| -2.953999999999922 | 3.645 | 0.207 | 0 |
| -2.950999999999922 | 3.622 | 0.204 | 0 |
| -2.947999999999922 | 3.6 | 0.202 | 0 |
| -2.944999999999922 | 3.578 | 0.199 | 0 |
| -2.941999999999922 | 3.556 | 0.197 | 0 |
| -2.938999999999922 | 3.534 | 0.194 | 0 |
| -2.935999999999922 | 3.512 | 0.192 | 0 |
| -2.932999999999922 | 3.49 | 0.189 | 0 |
| -2.929999999999922 | 3.469 | 0.187 | 0 |
| -2.926999999999921 | 3.447 | 0.185 | 0 |
| -2.923999999999921 | 3.426 | 0.182 | 0 |
| -2.920999999999921 | 3.404 | 0.18 | 0 |
| -2.917999999999921 | 3.383 | 0.178 | 0 |
| -2.914999999999921 | 3.362 | 0.175 | 0 |
| -2.911999999999921 | 3.341 | 0.173 | 0 |
| -2.908999999999921 | 3.32 | 0.171 | 0 |
| -2.905999999999921 | 3.299 | 0.168 | 0 |
| -2.902999999999921 | 3.279 | 0.166 | 0 |
| -2.89999999999992 | 3.258 | 0.164 | 0 |
| -2.89699999999992 | 3.237 | 0.162 | 0 |
| -2.89399999999992 | 3.217 | 0.16 | 0 |
| -2.89099999999992 | 3.197 | 0.158 | 0 |
| -2.88799999999992 | 3.176 | 0.155 | 0 |
| -2.88499999999992 | 3.156 | 0.153 | 0 |
| -2.88199999999992 | 3.136 | 0.151 | 0 |
| -2.87899999999992 | 3.116 | 0.149 | 0 |
| -2.875999999999919 | 3.097 | 0.147 | 0 |
| -2.872999999999919 | 3.077 | 0.145 | 0 |
| -2.869999999999919 | 3.057 | 0.143 | 0 |
| -2.866999999999919 | 3.038 | 0.141 | 0 |
| -2.863999999999919 | 3.018 | 0.139 | 0 |
| -2.860999999999919 | 2.999 | 0.137 | 0 |
| -2.857999999999919 | 2.979 | 0.135 | 0 |
| -2.854999999999919 | 2.96 | 0.134 | 0 |
| -2.851999999999919 | 2.941 | 0.132 | 0 |
| -2.848999999999918 | 2.922 | 0.13 | 0 |
| -2.845999999999918 | 2.903 | 0.128 | 0 |
| -2.842999999999918 | 2.884 | 0.126 | 0 |
| -2.839999999999918 | 2.866 | 0.124 | 0 |
| -2.836999999999918 | 2.847 | 0.123 | 0 |
| -2.833999999999918 | 2.828 | 0.121 | 0 |
| -2.830999999999918 | 2.81 | 0.119 | 0 |
| -2.827999999999918 | 2.792 | 0.118 | 0 |
| -2.824999999999918 | 2.773 | 0.116 | 0 |
| -2.821999999999917 | 2.755 | 0.114 | 0 |
| -2.818999999999917 | 2.737 | 0.112 | 0 |
| -2.815999999999917 | 2.719 | 0.111 | 0 |
| -2.812999999999917 | 2.701 | 0.109 | 0 |
| -2.809999999999917 | 2.683 | 0.108 | 0 |
| -2.806999999999917 | 2.665 | 0.106 | 0 |
| -2.803999999999917 | 2.648 | 0.104 | 0 |
| -2.800999999999917 | 2.63 | 0.103 | 0 |
| -2.797999999999916 | 2.613 | 0.101 | 0 |
| -2.794999999999916 | 2.595 | 0.1 | 0 |
| -2.791999999999916 | 2.578 | 0.098 | 0 |
| -2.788999999999916 | 2.561 | 0.097 | 0 |
| -2.785999999999916 | 2.544 | 0.095 | 0.001 |
| -2.782999999999916 | 2.527 | 0.094 | 0.001 |
| -2.779999999999916 | 2.51 | 0.093 | 0.001 |
| -2.776999999999916 | 2.493 | 0.091 | 0.001 |
| -2.773999999999916 | 2.476 | 0.09 | 0.001 |
| -2.770999999999915 | 2.459 | 0.088 | 0.001 |
| -2.767999999999915 | 2.443 | 0.087 | 0.001 |
| -2.764999999999915 | 2.426 | 0.086 | 0.001 |
| -2.761999999999915 | 2.41 | 0.084 | 0.001 |
| -2.758999999999915 | 2.393 | 0.083 | 0.001 |
| -2.755999999999915 | 2.377 | 0.082 | 0.001 |
| -2.752999999999915 | 2.361 | 0.08 | 0.001 |
| -2.749999999999915 | 2.345 | 0.079 | 0.001 |
| -2.746999999999915 | 2.329 | 0.078 | 0.001 |
| -2.743999999999914 | 2.313 | 0.077 | 0.001 |
| -2.740999999999914 | 2.297 | 0.075 | 0.001 |
| -2.737999999999914 | 2.281 | 0.074 | 0.001 |
| -2.734999999999914 | 2.265 | 0.073 | 0.001 |
| -2.731999999999914 | 2.25 | 0.072 | 0.001 |
| -2.728999999999914 | 2.234 | 0.071 | 0.001 |
| -2.725999999999914 | 2.219 | 0.069 | 0.001 |
| -2.722999999999914 | 2.203 | 0.068 | 0.001 |
| -2.719999999999914 | 2.188 | 0.067 | 0.002 |
| -2.716999999999913 | 2.173 | 0.066 | 0.002 |
| -2.713999999999913 | 2.158 | 0.065 | 0.002 |
| -2.710999999999913 | 2.143 | 0.064 | 0.002 |
| -2.707999999999913 | 2.128 | 0.063 | 0.002 |
| -2.704999999999913 | 2.113 | 0.062 | 0.002 |
| -2.701999999999913 | 2.098 | 0.061 | 0.002 |
| -2.698999999999913 | 2.083 | 0.06 | 0.002 |
| -2.695999999999913 | 2.068 | 0.059 | 0.002 |
| -2.692999999999912 | 2.054 | 0.058 | 0.002 |
| -2.689999999999912 | 2.039 | 0.057 | 0.002 |
| -2.686999999999912 | 2.025 | 0.056 | 0.002 |
| -2.683999999999912 | 2.011 | 0.055 | 0.002 |
| -2.680999999999912 | 1.996 | 0.054 | 0.003 |
| -2.677999999999912 | 1.982 | 0.053 | 0.003 |
| -2.674999999999912 | 1.968 | 0.052 | 0.003 |
| -2.671999999999912 | 1.954 | 0.051 | 0.003 |
| -2.668999999999912 | 1.94 | 0.05 | 0.003 |
| -2.665999999999911 | 1.926 | 0.049 | 0.003 |
| -2.662999999999911 | 1.912 | 0.048 | 0.003 |
| -2.659999999999911 | 1.898 | 0.047 | 0.003 |
| -2.656999999999911 | 1.885 | 0.047 | 0.003 |
| -2.653999999999911 | 1.871 | 0.046 | 0.004 |
| -2.650999999999911 | 1.857 | 0.045 | 0.004 |
| -2.647999999999911 | 1.844 | 0.044 | 0.004 |
| -2.644999999999911 | 1.831 | 0.043 | 0.004 |
| -2.641999999999911 | 1.817 | 0.042 | 0.004 |
| -2.63899999999991 | 1.804 | 0.042 | 0.004 |
| -2.63599999999991 | 1.791 | 0.041 | 0.004 |
| -2.63299999999991 | 1.778 | 0.04 | 0.005 |
| -2.62999999999991 | 1.765 | 0.039 | 0.005 |
| -2.62699999999991 | 1.752 | 0.039 | 0.005 |
| -2.62399999999991 | 1.739 | 0.038 | 0.005 |
| -2.62099999999991 | 1.726 | 0.037 | 0.005 |
| -2.61799999999991 | 1.713 | 0.036 | 0.005 |
| -2.61499999999991 | 1.701 | 0.036 | 0.005 |
| -2.611999999999909 | 1.688 | 0.035 | 0.006 |
| -2.608999999999909 | 1.676 | 0.034 | 0.006 |
| -2.605999999999909 | 1.663 | 0.034 | 0.006 |
| -2.602999999999909 | 1.651 | 0.033 | 0.006 |
| -2.599999999999909 | 1.638 | 0.032 | 0.006 |
| -2.596999999999909 | 1.626 | 0.032 | 0.007 |
| -2.593999999999909 | 1.614 | 0.031 | 0.007 |
| -2.590999999999909 | 1.602 | 0.03 | 0.007 |
| -2.587999999999909 | 1.59 | 0.03 | 0.007 |
| -2.584999999999908 | 1.578 | 0.029 | 0.007 |
| -2.581999999999908 | 1.566 | 0.029 | 0.008 |
| -2.578999999999908 | 1.554 | 0.028 | 0.008 |
| -2.575999999999908 | 1.542 | 0.028 | 0.008 |
| -2.572999999999908 | 1.531 | 0.027 | 0.008 |
| -2.569999999999908 | 1.519 | 0.026 | 0.009 |
| -2.566999999999908 | 1.507 | 0.026 | 0.009 |
| -2.563999999999908 | 1.496 | 0.025 | 0.009 |
| -2.560999999999908 | 1.484 | 0.025 | 0.009 |
| -2.557999999999907 | 1.473 | 0.024 | 0.01 |
| -2.554999999999907 | 1.462 | 0.024 | 0.01 |
| -2.551999999999907 | 1.45 | 0.023 | 0.01 |
| -2.548999999999907 | 1.439 | 0.023 | 0.01 |
| -2.545999999999907 | 1.428 | 0.022 | 0.011 |
| -2.542999999999907 | 1.417 | 0.022 | 0.011 |
| -2.539999999999907 | 1.406 | 0.021 | 0.011 |
| -2.536999999999907 | 1.395 | 0.021 | 0.011 |
| -2.533999999999907 | 1.384 | 0.02 | 0.012 |
| -2.530999999999906 | 1.374 | 0.02 | 0.012 |
| -2.527999999999906 | 1.363 | 0.019 | 0.012 |
| -2.524999999999906 | 1.352 | 0.019 | 0.013 |
| -2.521999999999906 | 1.342 | 0.019 | 0.013 |
| -2.518999999999906 | 1.331 | 0.018 | 0.013 |
| -2.515999999999906 | 1.32 | 0.018 | 0.014 |
| -2.512999999999906 | 1.31 | 0.017 | 0.014 |
| -2.509999999999906 | 1.3 | 0.017 | 0.014 |
| -2.506999999999906 | 1.289 | 0.017 | 0.015 |
| -2.503999999999905 | 1.279 | 0.016 | 0.015 |
| -2.500999999999905 | 1.269 | 0.016 | 0.016 |
| -2.497999999999905 | 1.259 | 0.015 | 0.016 |
| -2.494999999999905 | 1.249 | 0.015 | 0.016 |
| -2.491999999999905 | 1.239 | 0.015 | 0.017 |
| -2.488999999999905 | 1.229 | 0.014 | 0.017 |
| -2.485999999999905 | 1.219 | 0.014 | 0.017 |
| -2.482999999999905 | 1.209 | 0.014 | 0.018 |
| -2.479999999999904 | 1.199 | 0.013 | 0.018 |
| -2.476999999999904 | 1.19 | 0.013 | 0.019 |
| -2.473999999999904 | 1.18 | 0.013 | 0.019 |
| -2.470999999999904 | 1.171 | 0.012 | 0.02 |
| -2.467999999999904 | 1.161 | 0.012 | 0.02 |
| -2.464999999999904 | 1.152 | 0.012 | 0.02 |
| -2.461999999999904 | 1.142 | 0.011 | 0.021 |
| -2.458999999999904 | 1.133 | 0.011 | 0.021 |
| -2.455999999999904 | 1.124 | 0.011 | 0.022 |
| -2.452999999999903 | 1.114 | 0.011 | 0.022 |
| -2.449999999999903 | 1.105 | 0.01 | 0.023 |
| -2.446999999999903 | 1.096 | 0.01 | 0.023 |
| -2.443999999999903 | 1.087 | 0.01 | 0.024 |
| -2.440999999999903 | 1.078 | 0.009 | 0.024 |
| -2.437999999999903 | 1.069 | 0.009 | 0.025 |
| -2.434999999999903 | 1.06 | 0.009 | 0.025 |
| -2.431999999999903 | 1.051 | 0.009 | 0.026 |
| -2.428999999999903 | 1.042 | 0.008 | 0.027 |
| -2.425999999999902 | 1.034 | 0.008 | 0.027 |
| -2.422999999999902 | 1.025 | 0.008 | 0.028 |
| -2.419999999999902 | 1.016 | 0.008 | 0.028 |
| -2.416999999999902 | 1.008 | 0.008 | 0.029 |
| -2.413999999999902 | 0.999 | 0.007 | 0.029 |
| -2.410999999999902 | 0.991 | 0.007 | 0.03 |
| -2.407999999999902 | 0.983 | 0.007 | 0.031 |
| -2.404999999999902 | 0.974 | 0.007 | 0.031 |
| -2.401999999999902 | 0.966 | 0.007 | 0.032 |
| -2.398999999999901 | 0.958 | 0.006 | 0.033 |
| -2.395999999999901 | 0.949 | 0.006 | 0.033 |
| -2.392999999999901 | 0.941 | 0.006 | 0.034 |
| -2.389999999999901 | 0.933 | 0.006 | 0.035 |
| -2.386999999999901 | 0.925 | 0.006 | 0.035 |
| -2.383999999999901 | 0.917 | 0.005 | 0.036 |
| -2.380999999999901 | 0.909 | 0.005 | 0.037 |
| -2.377999999999901 | 0.901 | 0.005 | 0.037 |
| -2.3749999999999 | 0.894 | 0.005 | 0.038 |
| -2.3719999999999 | 0.886 | 0.005 | 0.039 |
| -2.3689999999999 | 0.878 | 0.005 | 0.04 |
| -2.3659999999999 | 0.87 | 0.004 | 0.04 |
| -2.3629999999999 | 0.863 | 0.004 | 0.041 |
| -2.3599999999999 | 0.855 | 0.004 | 0.042 |
| -2.3569999999999 | 0.848 | 0.004 | 0.043 |
| -2.3539999999999 | 0.84 | 0.004 | 0.044 |
| -2.3509999999999 | 0.833 | 0.004 | 0.044 |
| -2.347999999999899 | 0.825 | 0.004 | 0.045 |
| -2.344999999999899 | 0.818 | 0.004 | 0.046 |
| -2.341999999999899 | 0.811 | 0.003 | 0.047 |
| -2.338999999999899 | 0.804 | 0.003 | 0.048 |
| -2.335999999999899 | 0.796 | 0.003 | 0.049 |
| -2.332999999999899 | 0.789 | 0.003 | 0.049 |
| -2.329999999999899 | 0.782 | 0.003 | 0.05 |
| -2.326999999999899 | 0.775 | 0.003 | 0.051 |
| -2.323999999999899 | 0.768 | 0.003 | 0.052 |
| -2.320999999999898 | 0.761 | 0.003 | 0.053 |
| -2.317999999999898 | 0.754 | 0.003 | 0.054 |
| -2.314999999999898 | 0.748 | 0.002 | 0.055 |
| -2.311999999999898 | 0.741 | 0.002 | 0.056 |
| -2.308999999999898 | 0.734 | 0.002 | 0.057 |
| -2.305999999999898 | 0.727 | 0.002 | 0.058 |
| -2.302999999999898 | 0.721 | 0.002 | 0.059 |
| -2.299999999999898 | 0.714 | 0.002 | 0.06 |
| -2.296999999999898 | 0.707 | 0.002 | 0.061 |
| -2.293999999999897 | 0.701 | 0.002 | 0.062 |
| -2.290999999999897 | 0.694 | 0.002 | 0.063 |
| -2.287999999999897 | 0.688 | 0.002 | 0.064 |
| -2.284999999999897 | 0.682 | 0.002 | 0.065 |
| -2.281999999999897 | 0.675 | 0.002 | 0.066 |
| -2.278999999999897 | 0.669 | 0.002 | 0.068 |
| -2.275999999999897 | 0.663 | 0.001 | 0.069 |
| -2.272999999999897 | 0.657 | 0.001 | 0.07 |
| -2.269999999999897 | 0.65 | 0.001 | 0.071 |
| -2.266999999999896 | 0.644 | 0.001 | 0.072 |
| -2.263999999999896 | 0.638 | 0.001 | 0.073 |
| -2.260999999999896 | 0.632 | 0.001 | 0.075 |
| -2.257999999999896 | 0.626 | 0.001 | 0.076 |
| -2.254999999999896 | 0.62 | 0.001 | 0.077 |
| -2.251999999999896 | 0.614 | 0.001 | 0.078 |
| -2.248999999999896 | 0.608 | 0.001 | 0.08 |
| -2.245999999999896 | 0.603 | 0.001 | 0.081 |
| -2.242999999999896 | 0.597 | 0.001 | 0.082 |
| -2.239999999999895 | 0.591 | 0.001 | 0.083 |
| -2.236999999999895 | 0.585 | 0.001 | 0.085 |
| -2.233999999999895 | 0.58 | 0.001 | 0.086 |
| -2.230999999999895 | 0.574 | 0.001 | 0.087 |
| -2.227999999999895 | 0.569 | 0.001 | 0.089 |
| -2.224999999999895 | 0.563 | 0.001 | 0.09 |
| -2.221999999999895 | 0.557 | 0.001 | 0.092 |
| -2.218999999999895 | 0.552 | 0.001 | 0.093 |
| -2.215999999999894 | 0.547 | 0.001 | 0.094 |
| -2.212999999999894 | 0.541 | 0.001 | 0.096 |
| -2.209999999999894 | 0.536 | 0 | 0.097 |
| -2.206999999999894 | 0.531 | 0 | 0.099 |
| -2.203999999999894 | 0.525 | 0 | 0.1 |
| -2.200999999999894 | 0.52 | 0 | 0.102 |
| -2.197999999999894 | 0.515 | 0 | 0.103 |
| -2.194999999999894 | 0.51 | 0 | 0.105 |
| -2.191999999999894 | 0.505 | 0 | 0.107 |
| -2.188999999999893 | 0.5 | 0 | 0.108 |
| -2.185999999999893 | 0.495 | 0 | 0.11 |
| -2.182999999999893 | 0.49 | 0 | 0.111 |
| -2.179999999999893 | 0.485 | 0 | 0.113 |
| -2.176999999999893 | 0.48 | 0 | 0.115 |
| -2.173999999999893 | 0.475 | 0 | 0.116 |
| -2.170999999999893 | 0.47 | 0 | 0.118 |
| -2.167999999999893 | 0.465 | 0 | 0.12 |
| -2.164999999999893 | 0.461 | 0 | 0.122 |
| -2.161999999999892 | 0.456 | 0 | 0.123 |
| -2.158999999999892 | 0.451 | 0 | 0.125 |
| -2.155999999999892 | 0.446 | 0 | 0.127 |
| -2.152999999999892 | 0.442 | 0 | 0.129 |
| -2.149999999999892 | 0.437 | 0 | 0.131 |
| -2.146999999999892 | 0.433 | 0 | 0.132 |
| -2.143999999999892 | 0.428 | 0 | 0.134 |
| -2.140999999999892 | 0.424 | 0 | 0.136 |
| -2.137999999999892 | 0.419 | 0 | 0.138 |
| -2.134999999999891 | 0.415 | 0 | 0.14 |
| -2.131999999999891 | 0.411 | 0 | 0.142 |
| -2.128999999999891 | 0.406 | 0 | 0.144 |
| -2.125999999999891 | 0.402 | 0 | 0.146 |
| -2.122999999999891 | 0.398 | 0 | 0.148 |
| -2.119999999999891 | 0.393 | 0 | 0.15 |
| -2.116999999999891 | 0.389 | 0 | 0.152 |
| -2.113999999999891 | 0.385 | 0 | 0.154 |
| -2.110999999999891 | 0.381 | 0 | 0.156 |
| -2.10799999999989 | 0.377 | 0 | 0.158 |
| -2.10499999999989 | 0.373 | 0 | 0.16 |
| -2.10199999999989 | 0.369 | 0 | 0.163 |
| -2.09899999999989 | 0.365 | 0 | 0.165 |
| -2.09599999999989 | 0.361 | 0 | 0.167 |
| -2.09299999999989 | 0.357 | 0 | 0.169 |
| -2.08999999999989 | 0.353 | 0 | 0.171 |
| -2.08699999999989 | 0.349 | 0 | 0.174 |
| -2.083999999999889 | 0.345 | 0 | 0.176 |
| -2.080999999999889 | 0.341 | 0 | 0.178 |
| -2.077999999999889 | 0.338 | 0 | 0.181 |
| -2.074999999999889 | 0.334 | 0 | 0.183 |
| -2.071999999999889 | 0.33 | 0 | 0.185 |
| -2.068999999999889 | 0.326 | 0 | 0.188 |
| -2.065999999999889 | 0.323 | 0 | 0.19 |
| -2.062999999999889 | 0.319 | 0 | 0.193 |
| -2.059999999999889 | 0.316 | 0 | 0.195 |
| -2.056999999999888 | 0.312 | 0 | 0.198 |
| -2.053999999999888 | 0.309 | 0 | 0.2 |
| -2.050999999999888 | 0.305 | 0 | 0.203 |
| -2.047999999999888 | 0.302 | 0 | 0.205 |
| -2.044999999999888 | 0.298 | 0 | 0.208 |
| -2.041999999999888 | 0.295 | 0 | 0.211 |
| -2.038999999999888 | 0.291 | 0 | 0.213 |
| -2.035999999999888 | 0.288 | 0 | 0.216 |
| -2.032999999999888 | 0.285 | 0 | 0.219 |
| -2.029999999999887 | 0.281 | 0 | 0.221 |
| -2.026999999999887 | 0.278 | 0 | 0.224 |
| -2.023999999999887 | 0.275 | 0 | 0.227 |
| -2.020999999999887 | 0.272 | 0 | 0.23 |
| -2.017999999999887 | 0.268 | 0 | 0.232 |
| -2.014999999999887 | 0.265 | 0 | 0.235 |
| -2.011999999999887 | 0.262 | 0 | 0.238 |
| -2.008999999999887 | 0.259 | 0 | 0.241 |
| -2.005999999999887 | 0.256 | 0 | 0.244 |
| -2.002999999999886 | 0.253 | 0 | 0.247 |
| -1.999999999999886 | 0.25 | 0 | 0.25 |
| -1.996999999999887 | 0.247 | 0 | 0.253 |
| -1.993999999999887 | 0.244 | 0 | 0.256 |
| -1.990999999999887 | 0.241 | 0 | 0.259 |
| -1.987999999999887 | 0.238 | 0 | 0.262 |
| -1.984999999999887 | 0.235 | 0 | 0.265 |
| -1.981999999999887 | 0.232 | 0 | 0.268 |
| -1.978999999999887 | 0.23 | 0 | 0.272 |
| -1.975999999999887 | 0.227 | 0 | 0.275 |
| -1.972999999999887 | 0.224 | 0 | 0.278 |
| -1.969999999999888 | 0.221 | 0 | 0.281 |
| -1.966999999999888 | 0.219 | 0 | 0.285 |
| -1.963999999999888 | 0.216 | 0 | 0.288 |
| -1.960999999999888 | 0.213 | 0 | 0.291 |
| -1.957999999999888 | 0.211 | 0 | 0.295 |
| -1.954999999999888 | 0.208 | 0 | 0.298 |
| -1.951999999999888 | 0.205 | 0 | 0.302 |
| -1.948999999999888 | 0.203 | 0 | 0.305 |
| -1.945999999999888 | 0.2 | 0 | 0.309 |
| -1.942999999999889 | 0.198 | 0 | 0.312 |
| -1.939999999999889 | 0.195 | 0 | 0.316 |
| -1.936999999999889 | 0.193 | 0 | 0.319 |
| -1.933999999999889 | 0.19 | 0 | 0.323 |
| -1.930999999999889 | 0.188 | 0 | 0.326 |
| -1.927999999999889 | 0.185 | 0 | 0.33 |
| -1.924999999999889 | 0.183 | 0 | 0.334 |
| -1.921999999999889 | 0.181 | 0 | 0.338 |
| -1.918999999999889 | 0.178 | 0 | 0.341 |
| -1.91599999999989 | 0.176 | 0 | 0.345 |
| -1.91299999999989 | 0.174 | 0 | 0.349 |
| -1.90999999999989 | 0.171 | 0 | 0.353 |
| -1.90699999999989 | 0.169 | 0 | 0.357 |
| -1.90399999999989 | 0.167 | 0 | 0.361 |
| -1.90099999999989 | 0.165 | 0 | 0.365 |
| -1.89799999999989 | 0.163 | 0 | 0.369 |
| -1.89499999999989 | 0.16 | 0 | 0.373 |
| -1.89199999999989 | 0.158 | 0 | 0.377 |
| -1.88899999999989 | 0.156 | 0 | 0.381 |
| -1.885999999999891 | 0.154 | 0 | 0.385 |
| -1.882999999999891 | 0.152 | 0 | 0.389 |
| -1.879999999999891 | 0.15 | 0 | 0.393 |
| -1.876999999999891 | 0.148 | 0 | 0.398 |
| -1.873999999999891 | 0.146 | 0 | 0.402 |
| -1.870999999999891 | 0.144 | 0 | 0.406 |
| -1.867999999999891 | 0.142 | 0 | 0.411 |
| -1.864999999999891 | 0.14 | 0 | 0.415 |
| -1.861999999999891 | 0.138 | 0 | 0.419 |
| -1.858999999999892 | 0.136 | 0 | 0.424 |
| -1.855999999999892 | 0.134 | 0 | 0.428 |
| -1.852999999999892 | 0.132 | 0 | 0.433 |
| -1.849999999999892 | 0.131 | 0 | 0.437 |
| -1.846999999999892 | 0.129 | 0 | 0.442 |
| -1.843999999999892 | 0.127 | 0 | 0.446 |
| -1.840999999999892 | 0.125 | 0 | 0.451 |
| -1.837999999999892 | 0.123 | 0 | 0.456 |
| -1.834999999999892 | 0.122 | 0 | 0.461 |
| -1.831999999999893 | 0.12 | 0 | 0.465 |
| -1.828999999999893 | 0.118 | 0 | 0.47 |
| -1.825999999999893 | 0.116 | 0 | 0.475 |
| -1.822999999999893 | 0.115 | 0 | 0.48 |
| -1.819999999999893 | 0.113 | 0 | 0.485 |
| -1.816999999999893 | 0.111 | 0 | 0.49 |
| -1.813999999999893 | 0.11 | 0 | 0.495 |
| -1.810999999999893 | 0.108 | 0 | 0.5 |
| -1.807999999999893 | 0.107 | 0 | 0.505 |
| -1.804999999999894 | 0.105 | 0 | 0.51 |
| -1.801999999999894 | 0.103 | 0 | 0.515 |
| -1.798999999999894 | 0.102 | 0 | 0.52 |
| -1.795999999999894 | 0.1 | 0 | 0.525 |
| -1.792999999999894 | 0.099 | 0 | 0.531 |
| -1.789999999999894 | 0.097 | 0 | 0.536 |
| -1.786999999999894 | 0.096 | 0.001 | 0.541 |
| -1.783999999999894 | 0.094 | 0.001 | 0.547 |
| -1.780999999999894 | 0.093 | 0.001 | 0.552 |
| -1.777999999999894 | 0.092 | 0.001 | 0.557 |
| -1.774999999999895 | 0.09 | 0.001 | 0.563 |
| -1.771999999999895 | 0.089 | 0.001 | 0.569 |
| -1.768999999999895 | 0.087 | 0.001 | 0.574 |
| -1.765999999999895 | 0.086 | 0.001 | 0.58 |
| -1.762999999999895 | 0.085 | 0.001 | 0.585 |
| -1.759999999999895 | 0.083 | 0.001 | 0.591 |
| -1.756999999999895 | 0.082 | 0.001 | 0.597 |
| -1.753999999999895 | 0.081 | 0.001 | 0.603 |
| -1.750999999999895 | 0.08 | 0.001 | 0.608 |
| -1.747999999999896 | 0.078 | 0.001 | 0.614 |
| -1.744999999999896 | 0.077 | 0.001 | 0.62 |
| -1.741999999999896 | 0.076 | 0.001 | 0.626 |
| -1.738999999999896 | 0.075 | 0.001 | 0.632 |
| -1.735999999999896 | 0.073 | 0.001 | 0.638 |
| -1.732999999999896 | 0.072 | 0.001 | 0.644 |
| -1.729999999999896 | 0.071 | 0.001 | 0.65 |
| -1.726999999999896 | 0.07 | 0.001 | 0.657 |
| -1.723999999999896 | 0.069 | 0.001 | 0.663 |
| -1.720999999999897 | 0.068 | 0.002 | 0.669 |
| -1.717999999999897 | 0.066 | 0.002 | 0.675 |
| -1.714999999999897 | 0.065 | 0.002 | 0.682 |
| -1.711999999999897 | 0.064 | 0.002 | 0.688 |
| -1.708999999999897 | 0.063 | 0.002 | 0.694 |
| -1.705999999999897 | 0.062 | 0.002 | 0.701 |
| -1.702999999999897 | 0.061 | 0.002 | 0.707 |
| -1.699999999999897 | 0.06 | 0.002 | 0.714 |
| -1.696999999999897 | 0.059 | 0.002 | 0.721 |
| -1.693999999999897 | 0.058 | 0.002 | 0.727 |
| -1.690999999999898 | 0.057 | 0.002 | 0.734 |
| -1.687999999999898 | 0.056 | 0.002 | 0.741 |
| -1.684999999999898 | 0.055 | 0.002 | 0.748 |
| -1.681999999999898 | 0.054 | 0.003 | 0.754 |
| -1.678999999999898 | 0.053 | 0.003 | 0.761 |
| -1.675999999999898 | 0.052 | 0.003 | 0.768 |
| -1.672999999999898 | 0.051 | 0.003 | 0.775 |
| -1.669999999999898 | 0.05 | 0.003 | 0.782 |
| -1.666999999999898 | 0.049 | 0.003 | 0.789 |
| -1.663999999999899 | 0.049 | 0.003 | 0.796 |
| -1.660999999999899 | 0.048 | 0.003 | 0.804 |
| -1.657999999999899 | 0.047 | 0.003 | 0.811 |
| -1.654999999999899 | 0.046 | 0.004 | 0.818 |
| -1.651999999999899 | 0.045 | 0.004 | 0.825 |
| -1.648999999999899 | 0.044 | 0.004 | 0.833 |
| -1.645999999999899 | 0.044 | 0.004 | 0.84 |
| -1.642999999999899 | 0.043 | 0.004 | 0.848 |
| -1.639999999999899 | 0.042 | 0.004 | 0.855 |
| -1.6369999999999 | 0.041 | 0.004 | 0.863 |
| -1.6339999999999 | 0.04 | 0.004 | 0.87 |
| -1.6309999999999 | 0.04 | 0.005 | 0.878 |
| -1.6279999999999 | 0.039 | 0.005 | 0.886 |
| -1.6249999999999 | 0.038 | 0.005 | 0.894 |
| -1.6219999999999 | 0.037 | 0.005 | 0.901 |
| -1.6189999999999 | 0.037 | 0.005 | 0.909 |
| -1.6159999999999 | 0.036 | 0.005 | 0.917 |
| -1.6129999999999 | 0.035 | 0.006 | 0.925 |
| -1.609999999999901 | 0.035 | 0.006 | 0.933 |
| -1.606999999999901 | 0.034 | 0.006 | 0.941 |
| -1.603999999999901 | 0.033 | 0.006 | 0.949 |
| -1.600999999999901 | 0.033 | 0.006 | 0.958 |
| -1.597999999999901 | 0.032 | 0.007 | 0.966 |
| -1.594999999999901 | 0.031 | 0.007 | 0.974 |
| -1.591999999999901 | 0.031 | 0.007 | 0.983 |
| -1.588999999999901 | 0.03 | 0.007 | 0.991 |
| -1.585999999999901 | 0.029 | 0.007 | 0.999 |
| -1.582999999999902 | 0.029 | 0.008 | 1.008 |
| -1.579999999999902 | 0.028 | 0.008 | 1.016 |
| -1.576999999999902 | 0.028 | 0.008 | 1.025 |
| -1.573999999999902 | 0.027 | 0.008 | 1.034 |
| -1.570999999999902 | 0.027 | 0.008 | 1.042 |
| -1.567999999999902 | 0.026 | 0.009 | 1.051 |
| -1.564999999999902 | 0.025 | 0.009 | 1.06 |
| -1.561999999999902 | 0.025 | 0.009 | 1.069 |
| -1.558999999999902 | 0.024 | 0.009 | 1.078 |
| -1.555999999999903 | 0.024 | 0.01 | 1.087 |
| -1.552999999999903 | 0.023 | 0.01 | 1.096 |
| -1.549999999999903 | 0.023 | 0.01 | 1.105 |
| -1.546999999999903 | 0.022 | 0.011 | 1.114 |
| -1.543999999999903 | 0.022 | 0.011 | 1.124 |
| -1.540999999999903 | 0.021 | 0.011 | 1.133 |
| -1.537999999999903 | 0.021 | 0.011 | 1.142 |
| -1.534999999999903 | 0.02 | 0.012 | 1.152 |
| -1.531999999999903 | 0.02 | 0.012 | 1.161 |
| -1.528999999999904 | 0.02 | 0.012 | 1.171 |
| -1.525999999999904 | 0.019 | 0.013 | 1.18 |
| -1.522999999999904 | 0.019 | 0.013 | 1.19 |
| -1.519999999999904 | 0.018 | 0.013 | 1.199 |
| -1.516999999999904 | 0.018 | 0.014 | 1.209 |
| -1.513999999999904 | 0.017 | 0.014 | 1.219 |
| -1.510999999999904 | 0.017 | 0.014 | 1.229 |
| -1.507999999999904 | 0.017 | 0.015 | 1.239 |
| -1.504999999999904 | 0.016 | 0.015 | 1.249 |
| -1.501999999999905 | 0.016 | 0.015 | 1.259 |
| -1.498999999999905 | 0.016 | 0.016 | 1.269 |
| -1.495999999999905 | 0.015 | 0.016 | 1.279 |
| -1.492999999999905 | 0.015 | 0.017 | 1.289 |
| -1.489999999999905 | 0.014 | 0.017 | 1.3 |
| -1.486999999999905 | 0.014 | 0.017 | 1.31 |
| -1.483999999999905 | 0.014 | 0.018 | 1.32 |
| -1.480999999999905 | 0.013 | 0.018 | 1.331 |
| -1.477999999999905 | 0.013 | 0.019 | 1.342 |
| -1.474999999999905 | 0.013 | 0.019 | 1.352 |
| -1.471999999999906 | 0.012 | 0.019 | 1.363 |
| -1.468999999999906 | 0.012 | 0.02 | 1.374 |
| -1.465999999999906 | 0.012 | 0.02 | 1.384 |
| -1.462999999999906 | 0.011 | 0.021 | 1.395 |
| -1.459999999999906 | 0.011 | 0.021 | 1.406 |
| -1.456999999999906 | 0.011 | 0.022 | 1.417 |
| -1.453999999999906 | 0.011 | 0.022 | 1.428 |
| -1.450999999999906 | 0.01 | 0.023 | 1.439 |
| -1.447999999999906 | 0.01 | 0.023 | 1.45 |
| -1.444999999999907 | 0.01 | 0.024 | 1.462 |
| -1.441999999999907 | 0.01 | 0.024 | 1.473 |
| -1.438999999999907 | 0.009 | 0.025 | 1.484 |
| -1.435999999999907 | 0.009 | 0.025 | 1.496 |
| -1.432999999999907 | 0.009 | 0.026 | 1.507 |
| -1.429999999999907 | 0.009 | 0.026 | 1.519 |
| -1.426999999999907 | 0.008 | 0.027 | 1.531 |
| -1.423999999999907 | 0.008 | 0.028 | 1.542 |
| -1.420999999999907 | 0.008 | 0.028 | 1.554 |
| -1.417999999999908 | 0.008 | 0.029 | 1.566 |
| -1.414999999999908 | 0.007 | 0.029 | 1.578 |
| -1.411999999999908 | 0.007 | 0.03 | 1.59 |
| -1.408999999999908 | 0.007 | 0.03 | 1.602 |
| -1.405999999999908 | 0.007 | 0.031 | 1.614 |
| -1.402999999999908 | 0.007 | 0.032 | 1.626 |
| -1.399999999999908 | 0.006 | 0.032 | 1.638 |
| -1.396999999999908 | 0.006 | 0.033 | 1.651 |
| -1.393999999999908 | 0.006 | 0.034 | 1.663 |
| -1.390999999999908 | 0.006 | 0.034 | 1.676 |
| -1.387999999999909 | 0.006 | 0.035 | 1.688 |
| -1.384999999999909 | 0.005 | 0.036 | 1.701 |
| -1.381999999999909 | 0.005 | 0.036 | 1.713 |
| -1.378999999999909 | 0.005 | 0.037 | 1.726 |
| -1.375999999999909 | 0.005 | 0.038 | 1.739 |
| -1.372999999999909 | 0.005 | 0.039 | 1.752 |
| -1.369999999999909 | 0.005 | 0.039 | 1.765 |
| -1.366999999999909 | 0.005 | 0.04 | 1.778 |
| -1.363999999999909 | 0.004 | 0.041 | 1.791 |
| -1.36099999999991 | 0.004 | 0.042 | 1.804 |
| -1.35799999999991 | 0.004 | 0.042 | 1.817 |
| -1.35499999999991 | 0.004 | 0.043 | 1.831 |
| -1.35199999999991 | 0.004 | 0.044 | 1.844 |
| -1.34899999999991 | 0.004 | 0.045 | 1.857 |
| -1.34599999999991 | 0.004 | 0.046 | 1.871 |
| -1.34299999999991 | 0.003 | 0.047 | 1.885 |
| -1.33999999999991 | 0.003 | 0.047 | 1.898 |
| -1.33699999999991 | 0.003 | 0.048 | 1.912 |
| -1.333999999999911 | 0.003 | 0.049 | 1.926 |
| -1.330999999999911 | 0.003 | 0.05 | 1.94 |
| -1.327999999999911 | 0.003 | 0.051 | 1.954 |
| -1.324999999999911 | 0.003 | 0.052 | 1.968 |
| -1.321999999999911 | 0.003 | 0.053 | 1.982 |
| -1.318999999999911 | 0.003 | 0.054 | 1.996 |
| -1.315999999999911 | 0.002 | 0.055 | 2.011 |
| -1.312999999999911 | 0.002 | 0.056 | 2.025 |
| -1.309999999999911 | 0.002 | 0.057 | 2.039 |
| -1.306999999999912 | 0.002 | 0.058 | 2.054 |
| -1.303999999999912 | 0.002 | 0.059 | 2.068 |
| -1.300999999999912 | 0.002 | 0.06 | 2.083 |
| -1.297999999999912 | 0.002 | 0.061 | 2.098 |
| -1.294999999999912 | 0.002 | 0.062 | 2.113 |
| -1.291999999999912 | 0.002 | 0.063 | 2.128 |
| -1.288999999999912 | 0.002 | 0.064 | 2.143 |
| -1.285999999999912 | 0.002 | 0.065 | 2.158 |
| -1.282999999999912 | 0.002 | 0.066 | 2.173 |
| -1.279999999999913 | 0.002 | 0.067 | 2.188 |
| -1.276999999999913 | 0.001 | 0.068 | 2.203 |
| -1.273999999999913 | 0.001 | 0.069 | 2.219 |
| -1.270999999999913 | 0.001 | 0.071 | 2.234 |
| -1.267999999999913 | 0.001 | 0.072 | 2.25 |
| -1.264999999999913 | 0.001 | 0.073 | 2.265 |
| -1.261999999999913 | 0.001 | 0.074 | 2.281 |
| -1.258999999999913 | 0.001 | 0.075 | 2.297 |
| -1.255999999999913 | 0.001 | 0.077 | 2.313 |
| -1.252999999999913 | 0.001 | 0.078 | 2.329 |
| -1.249999999999914 | 0.001 | 0.079 | 2.345 |
| -1.246999999999914 | 0.001 | 0.08 | 2.361 |
| -1.243999999999914 | 0.001 | 0.082 | 2.377 |
| -1.240999999999914 | 0.001 | 0.083 | 2.393 |
| -1.237999999999914 | 0.001 | 0.084 | 2.41 |
| -1.234999999999914 | 0.001 | 0.086 | 2.426 |
| -1.231999999999914 | 0.001 | 0.087 | 2.443 |
| -1.228999999999914 | 0.001 | 0.088 | 2.459 |
| -1.225999999999914 | 0.001 | 0.09 | 2.476 |
| -1.222999999999915 | 0.001 | 0.091 | 2.493 |
| -1.219999999999915 | 0.001 | 0.093 | 2.51 |
| -1.216999999999915 | 0.001 | 0.094 | 2.527 |
| -1.213999999999915 | 0.001 | 0.095 | 2.544 |
| -1.210999999999915 | 0 | 0.097 | 2.561 |
| -1.207999999999915 | 0 | 0.098 | 2.578 |
| -1.204999999999915 | 0 | 0.1 | 2.595 |
| -1.201999999999915 | 0 | 0.101 | 2.613 |
| -1.198999999999915 | 0 | 0.103 | 2.63 |
| -1.195999999999916 | 0 | 0.104 | 2.648 |
| -1.192999999999916 | 0 | 0.106 | 2.665 |
| -1.189999999999916 | 0 | 0.108 | 2.683 |
| -1.186999999999916 | 0 | 0.109 | 2.701 |
| -1.183999999999916 | 0 | 0.111 | 2.719 |
| -1.180999999999916 | 0 | 0.112 | 2.737 |
| -1.177999999999916 | 0 | 0.114 | 2.755 |
| -1.174999999999916 | 0 | 0.116 | 2.773 |
| -1.171999999999916 | 0 | 0.118 | 2.792 |
| -1.168999999999917 | 0 | 0.119 | 2.81 |
| -1.165999999999917 | 0 | 0.121 | 2.828 |
| -1.162999999999917 | 0 | 0.123 | 2.847 |
| -1.159999999999917 | 0 | 0.124 | 2.866 |
| -1.156999999999917 | 0 | 0.126 | 2.884 |
| -1.153999999999917 | 0 | 0.128 | 2.903 |
| -1.150999999999917 | 0 | 0.13 | 2.922 |
| -1.147999999999917 | 0 | 0.132 | 2.941 |
| -1.144999999999917 | 0 | 0.134 | 2.96 |
| -1.141999999999918 | 0 | 0.135 | 2.979 |
| -1.138999999999918 | 0 | 0.137 | 2.999 |
| -1.135999999999918 | 0 | 0.139 | 3.018 |
| -1.132999999999918 | 0 | 0.141 | 3.038 |
| -1.129999999999918 | 0 | 0.143 | 3.057 |
| -1.126999999999918 | 0 | 0.145 | 3.077 |
| -1.123999999999918 | 0 | 0.147 | 3.097 |
| -1.120999999999918 | 0 | 0.149 | 3.116 |
| -1.117999999999918 | 0 | 0.151 | 3.136 |
| -1.114999999999918 | 0 | 0.153 | 3.156 |
| -1.111999999999919 | 0 | 0.155 | 3.176 |
| -1.108999999999919 | 0 | 0.158 | 3.197 |
| -1.105999999999919 | 0 | 0.16 | 3.217 |
| -1.102999999999919 | 0 | 0.162 | 3.237 |
| -1.099999999999919 | 0 | 0.164 | 3.258 |
| -1.096999999999919 | 0 | 0.166 | 3.279 |
| -1.093999999999919 | 0 | 0.168 | 3.299 |
| -1.090999999999919 | 0 | 0.171 | 3.32 |
| -1.087999999999919 | 0 | 0.173 | 3.341 |
| -1.08499999999992 | 0 | 0.175 | 3.362 |
| -1.08199999999992 | 0 | 0.178 | 3.383 |
| -1.07899999999992 | 0 | 0.18 | 3.404 |
| -1.07599999999992 | 0 | 0.182 | 3.426 |
| -1.07299999999992 | 0 | 0.185 | 3.447 |
| -1.06999999999992 | 0 | 0.187 | 3.469 |
| -1.06699999999992 | 0 | 0.189 | 3.49 |
| -1.06399999999992 | 0 | 0.192 | 3.512 |
| -1.06099999999992 | 0 | 0.194 | 3.534 |
| -1.057999999999921 | 0 | 0.197 | 3.556 |
| -1.054999999999921 | 0 | 0.199 | 3.578 |
| -1.051999999999921 | 0 | 0.202 | 3.6 |
| -1.048999999999921 | 0 | 0.204 | 3.622 |
| -1.045999999999921 | 0 | 0.207 | 3.645 |
| -1.042999999999921 | 0 | 0.21 | 3.667 |
| -1.039999999999921 | 0 | 0.212 | 3.689 |
| -1.036999999999921 | 0 | 0.215 | 3.712 |
| -1.033999999999921 | 0 | 0.218 | 3.735 |
| -1.030999999999922 | 0 | 0.22 | 3.758 |
| -1.027999999999922 | 0 | 0.223 | 3.781 |
| -1.024999999999922 | 0 | 0.226 | 3.804 |
| -1.021999999999922 | 0 | 0.229 | 3.827 |
| -1.018999999999922 | 0 | 0.232 | 3.85 |
| -1.015999999999922 | 0 | 0.234 | 3.874 |
| -1.012999999999922 | 0 | 0.237 | 3.897 |
| -1.009999999999922 | 0 | 0.24 | 3.921 |
| -1.006999999999922 | 0 | 0.243 | 3.944 |
| -1.003999999999923 | 0 | 0.246 | 3.968 |
| -1.000999999999923 | 0 | 0.249 | 3.992 |
| -0.997999999999923 | 0 | 0.252 | 4.016 |
| -0.994999999999923 | 0 | 0.255 | 4.04 |
| -0.991999999999923 | 0 | 0.258 | 4.064 |
| -0.988999999999923 | 0 | 0.261 | 4.089 |
| -0.985999999999923 | 0 | 0.264 | 4.113 |
| -0.982999999999923 | 0 | 0.267 | 4.138 |
| -0.979999999999923 | 0 | 0.271 | 4.162 |
| -0.976999999999923 | 0 | 0.274 | 4.187 |
| -0.973999999999923 | 0 | 0.277 | 4.212 |
| -0.970999999999923 | 0 | 0.28 | 4.237 |
| -0.967999999999923 | 0 | 0.284 | 4.262 |
| -0.964999999999923 | 0 | 0.287 | 4.287 |
| -0.961999999999923 | 0 | 0.29 | 4.313 |
| -0.958999999999923 | 0 | 0.294 | 4.338 |
| -0.955999999999923 | 0 | 0.297 | 4.364 |
| -0.952999999999923 | 0 | 0.3 | 4.389 |
| -0.949999999999923 | 0 | 0.304 | 4.415 |
| -0.946999999999923 | 0 | 0.307 | 4.441 |
| -0.943999999999923 | 0 | 0.311 | 4.467 |
| -0.940999999999923 | 0 | 0.314 | 4.493 |
| -0.937999999999923 | 0 | 0.318 | 4.52 |
| -0.934999999999923 | 0 | 0.322 | 4.546 |
| -0.931999999999923 | 0 | 0.325 | 4.572 |
| -0.928999999999923 | 0 | 0.329 | 4.599 |
| -0.925999999999923 | 0 | 0.333 | 4.626 |
| -0.922999999999923 | 0 | 0.336 | 4.652 |
| -0.919999999999923 | 0 | 0.34 | 4.679 |
| -0.916999999999923 | 0 | 0.344 | 4.706 |
| -0.913999999999923 | 0 | 0.348 | 4.734 |
| -0.910999999999923 | 0 | 0.352 | 4.761 |
| -0.907999999999923 | 0 | 0.355 | 4.788 |
| -0.904999999999923 | 0 | 0.359 | 4.816 |
| -0.901999999999923 | 0 | 0.363 | 4.844 |
| -0.898999999999922 | 0 | 0.367 | 4.871 |
| -0.895999999999922 | 0 | 0.371 | 4.899 |
| -0.892999999999922 | 0 | 0.375 | 4.927 |
| -0.889999999999922 | 0 | 0.38 | 4.955 |
| -0.886999999999922 | 0 | 0.384 | 4.984 |
| -0.883999999999922 | 0 | 0.388 | 5.012 |
| -0.880999999999922 | 0 | 0.392 | 5.04 |
| -0.877999999999922 | 0 | 0.396 | 5.069 |
| -0.874999999999922 | 0 | 0.4 | 5.098 |
| -0.871999999999922 | 0 | 0.405 | 5.127 |
| -0.868999999999922 | 0 | 0.409 | 5.156 |
| -0.865999999999922 | 0 | 0.413 | 5.185 |
| -0.862999999999922 | 0 | 0.418 | 5.214 |
| -0.859999999999922 | 0 | 0.422 | 5.243 |
| -0.856999999999922 | 0 | 0.427 | 5.273 |
| -0.853999999999922 | 0 | 0.431 | 5.302 |
| -0.850999999999922 | 0 | 0.436 | 5.332 |
| -0.847999999999922 | 0 | 0.44 | 5.362 |
| -0.844999999999922 | 0 | 0.445 | 5.392 |
| -0.841999999999922 | 0 | 0.45 | 5.422 |
| -0.838999999999922 | 0 | 0.454 | 5.452 |
| -0.835999999999922 | 0 | 0.459 | 5.482 |
| -0.832999999999922 | 0 | 0.464 | 5.513 |
| -0.829999999999922 | 0 | 0.468 | 5.543 |
| -0.826999999999922 | 0 | 0.473 | 5.574 |
| -0.823999999999922 | 0 | 0.478 | 5.605 |
| -0.820999999999922 | 0 | 0.483 | 5.636 |
| -0.817999999999922 | 0 | 0.488 | 5.667 |
| -0.814999999999922 | 0 | 0.493 | 5.698 |
| -0.811999999999922 | 0 | 0.498 | 5.73 |
| -0.808999999999922 | 0 | 0.503 | 5.761 |
| -0.805999999999922 | 0 | 0.508 | 5.793 |
| -0.802999999999922 | 0 | 0.513 | 5.825 |
| -0.799999999999922 | 0 | 0.518 | 5.856 |
| -0.796999999999922 | 0 | 0.524 | 5.888 |
| -0.793999999999922 | 0 | 0.529 | 5.921 |
| -0.790999999999922 | 0 | 0.534 | 5.953 |
| -0.787999999999922 | 0.001 | 0.539 | 5.985 |
| -0.784999999999922 | 0.001 | 0.545 | 6.018 |
| -0.781999999999922 | 0.001 | 0.55 | 6.05 |
| -0.778999999999922 | 0.001 | 0.556 | 6.083 |
| -0.775999999999922 | 0.001 | 0.561 | 6.116 |
| -0.772999999999922 | 0.001 | 0.567 | 6.149 |
| -0.769999999999922 | 0.001 | 0.572 | 6.182 |
| -0.766999999999922 | 0.001 | 0.578 | 6.216 |
| -0.763999999999922 | 0.001 | 0.583 | 6.249 |
| -0.760999999999922 | 0.001 | 0.589 | 6.283 |
| -0.757999999999922 | 0.001 | 0.595 | 6.317 |
| -0.754999999999922 | 0.001 | 0.601 | 6.35 |
| -0.751999999999922 | 0.001 | 0.606 | 6.384 |
| -0.748999999999922 | 0.001 | 0.612 | 6.419 |
| -0.745999999999922 | 0.001 | 0.618 | 6.453 |
| -0.742999999999922 | 0.001 | 0.624 | 6.487 |
| -0.739999999999922 | 0.001 | 0.63 | 6.522 |
| -0.736999999999922 | 0.001 | 0.636 | 6.557 |
| -0.733999999999922 | 0.001 | 0.642 | 6.591 |
| -0.730999999999922 | 0.001 | 0.648 | 6.626 |
| -0.727999999999922 | 0.001 | 0.654 | 6.662 |
| -0.724999999999922 | 0.001 | 0.661 | 6.697 |
| -0.721999999999922 | 0.001 | 0.667 | 6.732 |
| -0.718999999999922 | 0.002 | 0.673 | 6.768 |
| -0.715999999999922 | 0.002 | 0.68 | 6.803 |
| -0.712999999999922 | 0.002 | 0.686 | 6.839 |
| -0.709999999999922 | 0.002 | 0.692 | 6.875 |
| -0.706999999999922 | 0.002 | 0.699 | 6.911 |
| -0.703999999999922 | 0.002 | 0.705 | 6.947 |
| -0.700999999999922 | 0.002 | 0.712 | 6.984 |
| -0.697999999999922 | 0.002 | 0.718 | 7.02 |
| -0.694999999999922 | 0.002 | 0.725 | 7.057 |
| -0.691999999999922 | 0.002 | 0.732 | 7.094 |
| -0.688999999999922 | 0.002 | 0.739 | 7.131 |
| -0.685999999999922 | 0.002 | 0.745 | 7.168 |
| -0.682999999999922 | 0.003 | 0.752 | 7.205 |
| -0.679999999999922 | 0.003 | 0.759 | 7.243 |
| -0.676999999999922 | 0.003 | 0.766 | 7.28 |
| -0.673999999999922 | 0.003 | 0.773 | 7.318 |
| -0.670999999999922 | 0.003 | 0.78 | 7.356 |
| -0.667999999999922 | 0.003 | 0.787 | 7.394 |
| -0.664999999999922 | 0.003 | 0.794 | 7.432 |
| -0.661999999999922 | 0.003 | 0.801 | 7.47 |
| -0.658999999999922 | 0.003 | 0.808 | 7.508 |
| -0.655999999999922 | 0.004 | 0.816 | 7.547 |
| -0.652999999999922 | 0.004 | 0.823 | 7.586 |
| -0.649999999999922 | 0.004 | 0.83 | 7.625 |
| -0.646999999999922 | 0.004 | 0.838 | 7.664 |
| -0.643999999999922 | 0.004 | 0.845 | 7.703 |
| -0.640999999999922 | 0.004 | 0.853 | 7.742 |
| -0.637999999999922 | 0.004 | 0.86 | 7.781 |
| -0.634999999999922 | 0.004 | 0.868 | 7.821 |
| -0.631999999999922 | 0.005 | 0.876 | 7.861 |
| -0.628999999999922 | 0.005 | 0.883 | 7.901 |
| -0.625999999999922 | 0.005 | 0.891 | 7.941 |
| -0.622999999999922 | 0.005 | 0.899 | 7.981 |
| -0.619999999999922 | 0.005 | 0.907 | 8.021 |
| -0.616999999999922 | 0.005 | 0.915 | 8.062 |
| -0.613999999999922 | 0.006 | 0.923 | 8.103 |
| -0.610999999999922 | 0.006 | 0.931 | 8.143 |
| -0.607999999999922 | 0.006 | 0.939 | 8.184 |
| -0.604999999999922 | 0.006 | 0.947 | 8.225 |
| -0.601999999999922 | 0.006 | 0.955 | 8.267 |
| -0.598999999999922 | 0.006 | 0.963 | 8.308 |
| -0.595999999999922 | 0.007 | 0.971 | 8.35 |
| -0.592999999999922 | 0.007 | 0.98 | 8.392 |
| -0.589999999999922 | 0.007 | 0.988 | 8.434 |
| -0.586999999999922 | 0.007 | 0.997 | 8.476 |
| -0.583999999999922 | 0.007 | 1.005 | 8.518 |
| -0.580999999999922 | 0.008 | 1.014 | 8.56 |
| -0.577999999999922 | 0.008 | 1.022 | 8.603 |
| -0.574999999999922 | 0.008 | 1.031 | 8.645 |
| -0.571999999999922 | 0.008 | 1.04 | 8.688 |
| -0.568999999999922 | 0.009 | 1.048 | 8.731 |
| -0.565999999999922 | 0.009 | 1.057 | 8.774 |
| -0.562999999999922 | 0.009 | 1.066 | 8.818 |
| -0.559999999999922 | 0.009 | 1.075 | 8.861 |
| -0.556999999999922 | 0.01 | 1.084 | 8.905 |
| -0.553999999999922 | 0.01 | 1.093 | 8.949 |
| -0.550999999999922 | 0.01 | 1.102 | 8.993 |
| -0.547999999999922 | 0.01 | 1.111 | 9.037 |
| -0.544999999999922 | 0.011 | 1.12 | 9.081 |
| -0.541999999999922 | 0.011 | 1.13 | 9.126 |
| -0.538999999999922 | 0.011 | 1.139 | 9.17 |
| -0.535999999999922 | 0.012 | 1.148 | 9.215 |
| -0.532999999999922 | 0.012 | 1.158 | 9.26 |
| -0.529999999999922 | 0.012 | 1.167 | 9.305 |
| -0.526999999999922 | 0.013 | 1.177 | 9.351 |
| -0.523999999999922 | 0.013 | 1.187 | 9.396 |
| -0.520999999999922 | 0.013 | 1.196 | 9.442 |
| -0.517999999999922 | 0.013 | 1.206 | 9.487 |
| -0.514999999999922 | 0.014 | 1.216 | 9.533 |
| -0.511999999999922 | 0.014 | 1.226 | 9.579 |
| -0.508999999999922 | 0.015 | 1.236 | 9.626 |
| -0.505999999999922 | 0.015 | 1.245 | 9.672 |
| -0.502999999999922 | 0.015 | 1.256 | 9.719 |
| -0.499999999999922 | 0.016 | 1.266 | 9.766 |
| -0.496999999999922 | 0.016 | 1.276 | 9.813 |
| -0.493999999999922 | 0.016 | 1.286 | 9.86 |
| -0.490999999999922 | 0.017 | 1.296 | 9.907 |
| -0.487999999999922 | 0.017 | 1.307 | 9.954 |
| -0.484999999999922 | 0.018 | 1.317 | 10.002 |
| -0.481999999999922 | 0.018 | 1.327 | 10.05 |
| -0.478999999999922 | 0.018 | 1.338 | 10.098 |
| -0.475999999999922 | 0.019 | 1.349 | 10.146 |
| -0.472999999999922 | 0.019 | 1.359 | 10.194 |
| -0.469999999999922 | 0.02 | 1.37 | 10.243 |
| -0.466999999999922 | 0.02 | 1.381 | 10.292 |
| -0.463999999999922 | 0.021 | 1.392 | 10.34 |
| -0.460999999999922 | 0.021 | 1.402 | 10.389 |
| -0.457999999999922 | 0.022 | 1.413 | 10.439 |
| -0.454999999999922 | 0.022 | 1.424 | 10.488 |
| -0.451999999999922 | 0.023 | 1.436 | 10.538 |
| -0.448999999999922 | 0.023 | 1.447 | 10.587 |
| -0.445999999999922 | 0.024 | 1.458 | 10.637 |
| -0.442999999999922 | 0.024 | 1.469 | 10.687 |
| -0.439999999999922 | 0.025 | 1.481 | 10.737 |
| -0.436999999999922 | 0.025 | 1.492 | 10.788 |
| -0.433999999999922 | 0.026 | 1.504 | 10.838 |
| -0.430999999999922 | 0.026 | 1.515 | 10.889 |
| -0.427999999999922 | 0.027 | 1.527 | 10.94 |
| -0.424999999999922 | 0.027 | 1.538 | 10.991 |
| -0.421999999999922 | 0.028 | 1.55 | 11.043 |
| -0.418999999999922 | 0.028 | 1.562 | 11.094 |
| -0.415999999999922 | 0.029 | 1.574 | 11.146 |
| -0.412999999999922 | 0.03 | 1.586 | 11.198 |
| -0.409999999999922 | 0.03 | 1.598 | 11.25 |
| -0.406999999999922 | 0.031 | 1.61 | 11.302 |
| -0.403999999999922 | 0.032 | 1.622 | 11.354 |
| -0.400999999999922 | 0.032 | 1.634 | 11.407 |
| -0.397999999999922 | 0.033 | 1.647 | 11.46 |
| -0.394999999999922 | 0.033 | 1.659 | 11.513 |
| -0.391999999999922 | 0.034 | 1.671 | 11.566 |
| -0.388999999999922 | 0.035 | 1.684 | 11.619 |
| -0.385999999999922 | 0.036 | 1.697 | 11.672 |
| -0.382999999999922 | 0.036 | 1.709 | 11.726 |
| -0.379999999999922 | 0.037 | 1.722 | 11.78 |
| -0.376999999999922 | 0.038 | 1.735 | 11.834 |
| -0.373999999999922 | 0.038 | 1.748 | 11.888 |
| -0.370999999999922 | 0.039 | 1.76 | 11.943 |
| -0.367999999999922 | 0.04 | 1.773 | 11.997 |
| -0.364999999999922 | 0.041 | 1.787 | 12.052 |
| -0.361999999999922 | 0.041 | 1.8 | 12.107 |
| -0.358999999999922 | 0.042 | 1.813 | 12.162 |
| -0.355999999999922 | 0.043 | 1.826 | 12.218 |
| -0.352999999999922 | 0.044 | 1.84 | 12.273 |
| -0.349999999999922 | 0.045 | 1.853 | 12.329 |
| -0.346999999999922 | 0.045 | 1.867 | 12.385 |
| -0.343999999999922 | 0.046 | 1.88 | 12.441 |
| -0.340999999999922 | 0.047 | 1.894 | 12.497 |
| -0.337999999999922 | 0.048 | 1.907 | 12.554 |
| -0.334999999999922 | 0.049 | 1.921 | 12.61 |
| -0.331999999999922 | 0.05 | 1.935 | 12.667 |
| -0.328999999999922 | 0.051 | 1.949 | 12.724 |
| -0.325999999999922 | 0.052 | 1.963 | 12.782 |
| -0.322999999999922 | 0.053 | 1.977 | 12.839 |
| -0.319999999999922 | 0.053 | 1.991 | 12.897 |
| -0.316999999999922 | 0.054 | 2.006 | 12.955 |
| -0.313999999999922 | 0.055 | 2.02 | 13.013 |
| -0.310999999999922 | 0.056 | 2.035 | 13.071 |
| -0.307999999999922 | 0.057 | 2.049 | 13.129 |
| -0.304999999999922 | 0.058 | 2.064 | 13.188 |
| -0.301999999999922 | 0.059 | 2.078 | 13.247 |
| -0.298999999999922 | 0.06 | 2.093 | 13.306 |
| -0.295999999999922 | 0.061 | 2.108 | 13.365 |
| -0.292999999999922 | 0.062 | 2.123 | 13.424 |
| -0.289999999999922 | 0.064 | 2.138 | 13.484 |
| -0.286999999999922 | 0.065 | 2.153 | 13.544 |
| -0.283999999999922 | 0.066 | 2.168 | 13.604 |
| -0.280999999999922 | 0.067 | 2.183 | 13.664 |
| -0.277999999999922 | 0.068 | 2.198 | 13.724 |
| -0.274999999999922 | 0.069 | 2.214 | 13.785 |
| -0.271999999999922 | 0.07 | 2.229 | 13.846 |
| -0.268999999999922 | 0.071 | 2.245 | 13.907 |
| -0.265999999999922 | 0.073 | 2.26 | 13.968 |
| -0.262999999999922 | 0.074 | 2.276 | 14.029 |
| -0.259999999999922 | 0.075 | 2.292 | 14.091 |
| -0.256999999999922 | 0.076 | 2.307 | 14.153 |
| -0.253999999999922 | 0.077 | 2.323 | 14.215 |
| -0.250999999999922 | 0.079 | 2.339 | 14.277 |
| -0.247999999999922 | 0.08 | 2.355 | 14.339 |
| -0.244999999999922 | 0.081 | 2.372 | 14.402 |
| -0.241999999999922 | 0.083 | 2.388 | 14.465 |
| -0.238999999999922 | 0.084 | 2.404 | 14.528 |
| -0.235999999999922 | 0.085 | 2.421 | 14.591 |
| -0.232999999999922 | 0.087 | 2.437 | 14.655 |
| -0.229999999999922 | 0.088 | 2.454 | 14.718 |
| -0.226999999999922 | 0.089 | 2.47 | 14.782 |
| -0.223999999999922 | 0.091 | 2.487 | 14.846 |
| -0.220999999999922 | 0.092 | 2.504 | 14.911 |
| -0.217999999999922 | 0.093 | 2.521 | 14.975 |
| -0.214999999999922 | 0.095 | 2.538 | 15.04 |
| -0.211999999999922 | 0.096 | 2.555 | 15.105 |
| -0.208999999999922 | 0.098 | 2.572 | 15.17 |
| -0.205999999999922 | 0.099 | 2.59 | 15.235 |
| -0.202999999999922 | 0.101 | 2.607 | 15.301 |
| -0.199999999999922 | 0.102 | 2.624 | 15.366 |
| -0.196999999999922 | 0.104 | 2.642 | 15.432 |
| -0.193999999999922 | 0.106 | 2.66 | 15.499 |
| -0.190999999999922 | 0.107 | 2.677 | 15.565 |
| -0.187999999999922 | 0.109 | 2.695 | 15.632 |
| -0.184999999999922 | 0.11 | 2.713 | 15.698 |
| -0.181999999999922 | 0.112 | 2.731 | 15.765 |
| -0.178999999999922 | 0.114 | 2.749 | 15.833 |
| -0.175999999999922 | 0.115 | 2.767 | 15.9 |
| -0.172999999999922 | 0.117 | 2.785 | 15.968 |
| -0.169999999999922 | 0.119 | 2.804 | 16.036 |
| -0.166999999999922 | 0.12 | 2.822 | 16.104 |
| -0.163999999999922 | 0.122 | 2.841 | 16.172 |
| -0.160999999999922 | 0.124 | 2.859 | 16.241 |
| -0.157999999999922 | 0.126 | 2.878 | 16.309 |
| -0.154999999999922 | 0.127 | 2.897 | 16.378 |
| -0.151999999999922 | 0.129 | 2.916 | 16.448 |
| -0.148999999999922 | 0.131 | 2.935 | 16.517 |
| -0.145999999999922 | 0.133 | 2.954 | 16.587 |
| -0.142999999999922 | 0.135 | 2.973 | 16.656 |
| -0.139999999999922 | 0.137 | 2.992 | 16.726 |
| -0.136999999999922 | 0.139 | 3.012 | 16.797 |
| -0.133999999999922 | 0.141 | 3.031 | 16.867 |
| -0.130999999999922 | 0.143 | 3.051 | 16.938 |
| -0.127999999999922 | 0.145 | 3.07 | 17.009 |
| -0.124999999999922 | 0.147 | 3.09 | 17.08 |
| -0.121999999999922 | 0.149 | 3.11 | 17.152 |
| -0.118999999999922 | 0.151 | 3.13 | 17.223 |
| -0.115999999999922 | 0.153 | 3.15 | 17.295 |
| -0.112999999999922 | 0.155 | 3.17 | 17.367 |
| -0.109999999999922 | 0.157 | 3.19 | 17.439 |
| -0.106999999999922 | 0.159 | 3.21 | 17.512 |
| -0.103999999999922 | 0.161 | 3.231 | 17.585 |
| -0.100999999999922 | 0.163 | 3.251 | 17.658 |
| -0.0979999999999218 | 0.165 | 3.272 | 17.731 |
| -0.0949999999999218 | 0.168 | 3.292 | 17.804 |
| -0.0919999999999218 | 0.17 | 3.313 | 17.878 |
| -0.0889999999999218 | 0.172 | 3.334 | 17.952 |
| -0.0859999999999218 | 0.174 | 3.355 | 18.026 |
| -0.0829999999999218 | 0.177 | 3.376 | 18.1 |
| -0.0799999999999218 | 0.179 | 3.397 | 18.175 |
| -0.0769999999999218 | 0.181 | 3.419 | 18.25 |
| -0.0739999999999218 | 0.184 | 3.44 | 18.325 |
| -0.0709999999999218 | 0.186 | 3.462 | 18.4 |
| -0.0679999999999218 | 0.189 | 3.483 | 18.475 |
| -0.0649999999999218 | 0.191 | 3.505 | 18.551 |
| -0.0619999999999218 | 0.194 | 3.527 | 18.627 |
| -0.0589999999999218 | 0.196 | 3.548 | 18.703 |
| -0.0559999999999218 | 0.199 | 3.57 | 18.78 |
| -0.0529999999999218 | 0.201 | 3.593 | 18.856 |
| -0.0499999999999218 | 0.204 | 3.615 | 18.933 |
| -0.0469999999999218 | 0.206 | 3.637 | 19.011 |
| -0.0439999999999218 | 0.209 | 3.659 | 19.088 |
| -0.0409999999999218 | 0.211 | 3.682 | 19.165 |
| -0.0379999999999218 | 0.214 | 3.705 | 19.243 |
| -0.0349999999999218 | 0.217 | 3.727 | 19.321 |
| -0.0319999999999218 | 0.22 | 3.75 | 19.4 |
| -0.0289999999999218 | 0.222 | 3.773 | 19.478 |
| -0.0259999999999218 | 0.225 | 3.796 | 19.557 |
| -0.0229999999999218 | 0.228 | 3.819 | 19.636 |
| -0.0199999999999218 | 0.231 | 3.842 | 19.715 |
| -0.0169999999999218 | 0.233 | 3.866 | 19.795 |
| -0.0139999999999218 | 0.236 | 3.889 | 19.875 |
| -0.0109999999999218 | 0.239 | 3.913 | 19.955 |
| -0.00799999999992176 | 0.242 | 3.936 | 20.035 |
| -0.00499999999992176 | 0.245 | 3.96 | 20.115 |
| -0.00199999999992176 | 0.248 | 3.984 | 20.196 |
| 0.00100000000007824 | 0.251 | 4.008 | 20.277 |
| 0.00400000000007824 | 0.254 | 4.032 | 20.358 |
| 0.00700000000007823 | 0.257 | 4.056 | 20.44 |
| 0.0100000000000782 | 0.26 | 4.081 | 20.521 |
| 0.0130000000000782 | 0.263 | 4.105 | 20.603 |
| 0.0160000000000782 | 0.266 | 4.13 | 20.685 |
| 0.0190000000000782 | 0.27 | 4.154 | 20.768 |
| 0.0220000000000782 | 0.273 | 4.179 | 20.851 |
| 0.0250000000000782 | 0.276 | 4.204 | 20.933 |
| 0.0280000000000782 | 0.279 | 4.229 | 21.017 |
| 0.0310000000000782 | 0.282 | 4.254 | 21.1 |
| 0.0340000000000782 | 0.286 | 4.279 | 21.184 |
| 0.0370000000000782 | 0.289 | 4.304 | 21.268 |
| 0.0400000000000782 | 0.292 | 4.33 | 21.352 |
| 0.0430000000000782 | 0.296 | 4.355 | 21.436 |
| 0.0460000000000782 | 0.299 | 4.381 | 21.521 |
| 0.0490000000000782 | 0.303 | 4.407 | 21.606 |
| 0.0520000000000782 | 0.306 | 4.433 | 21.691 |
| 0.0550000000000782 | 0.31 | 4.458 | 21.776 |
| 0.0580000000000782 | 0.313 | 4.485 | 21.862 |
| 0.0610000000000782 | 0.317 | 4.511 | 21.948 |
| 0.0640000000000782 | 0.32 | 4.537 | 22.034 |
| 0.0670000000000782 | 0.324 | 4.564 | 22.121 |
| 0.0700000000000783 | 0.328 | 4.59 | 22.207 |
| 0.0730000000000783 | 0.331 | 4.617 | 22.294 |
| 0.0760000000000783 | 0.335 | 4.644 | 22.381 |
| 0.0790000000000783 | 0.339 | 4.67 | 22.469 |
| 0.0820000000000783 | 0.343 | 4.697 | 22.556 |
| 0.0850000000000783 | 0.346 | 4.725 | 22.644 |
| 0.0880000000000783 | 0.35 | 4.752 | 22.733 |
| 0.0910000000000783 | 0.354 | 4.779 | 22.821 |
| 0.0940000000000783 | 0.358 | 4.807 | 22.91 |
| 0.0970000000000783 | 0.362 | 4.834 | 22.999 |
| 0.100000000000078 | 0.366 | 4.862 | 23.088 |
| 0.103000000000078 | 0.37 | 4.89 | 23.178 |
| 0.106000000000078 | 0.374 | 4.918 | 23.267 |
| 0.109000000000078 | 0.378 | 4.946 | 23.357 |
| 0.112000000000078 | 0.382 | 4.974 | 23.448 |
| 0.115000000000078 | 0.386 | 5.002 | 23.538 |
| 0.118000000000078 | 0.391 | 5.031 | 23.629 |
| 0.121000000000078 | 0.395 | 5.059 | 23.72 |
| 0.124000000000078 | 0.399 | 5.088 | 23.811 |
| 0.127000000000078 | 0.403 | 5.117 | 23.903 |
| 0.130000000000078 | 0.408 | 5.146 | 23.995 |
| 0.133000000000078 | 0.412 | 5.175 | 24.087 |
| 0.136000000000078 | 0.416 | 5.204 | 24.179 |
| 0.139000000000078 | 0.421 | 5.233 | 24.272 |
| 0.142000000000078 | 0.425 | 5.263 | 24.365 |
| 0.145000000000078 | 0.43 | 5.292 | 24.458 |
| 0.148000000000078 | 0.434 | 5.322 | 24.552 |
| 0.151000000000078 | 0.439 | 5.352 | 24.645 |
| 0.154000000000078 | 0.443 | 5.382 | 24.739 |
| 0.157000000000078 | 0.448 | 5.412 | 24.834 |
| 0.160000000000078 | 0.453 | 5.442 | 24.928 |
| 0.163000000000078 | 0.457 | 5.472 | 25.023 |
| 0.166000000000078 | 0.462 | 5.503 | 25.118 |
| 0.169000000000078 | 0.467 | 5.533 | 25.213 |
| 0.172000000000078 | 0.472 | 5.564 | 25.309 |
| 0.175000000000078 | 0.477 | 5.595 | 25.405 |
| 0.178000000000078 | 0.481 | 5.626 | 25.501 |
| 0.181000000000078 | 0.486 | 5.657 | 25.597 |
| 0.184000000000078 | 0.491 | 5.688 | 25.694 |
| 0.187000000000078 | 0.496 | 5.719 | 25.791 |
| 0.190000000000078 | 0.501 | 5.751 | 25.888 |
| 0.193000000000078 | 0.506 | 5.782 | 25.986 |
| 0.196000000000078 | 0.512 | 5.814 | 26.084 |
| 0.199000000000078 | 0.517 | 5.846 | 26.182 |
| 0.202000000000078 | 0.522 | 5.878 | 26.28 |
| 0.205000000000078 | 0.527 | 5.91 | 26.379 |
| 0.208000000000078 | 0.532 | 5.942 | 26.478 |
| 0.211000000000078 | 0.538 | 5.974 | 26.577 |
| 0.214000000000078 | 0.543 | 6.007 | 26.676 |
| 0.217000000000078 | 0.548 | 6.04 | 26.776 |
| 0.220000000000078 | 0.554 | 6.072 | 26.876 |
| 0.223000000000078 | 0.559 | 6.105 | 26.976 |
| 0.226000000000078 | 0.565 | 6.138 | 27.077 |
| 0.229000000000078 | 0.57 | 6.171 | 27.178 |
| 0.232000000000078 | 0.576 | 6.205 | 27.279 |
| 0.235000000000078 | 0.582 | 6.238 | 27.38 |
| 0.238000000000078 | 0.587 | 6.272 | 27.482 |
| 0.241000000000078 | 0.593 | 6.305 | 27.584 |
| 0.244000000000078 | 0.599 | 6.339 | 27.686 |
| 0.247000000000078 | 0.605 | 6.373 | 27.789 |
| 0.250000000000078 | 0.61 | 6.407 | 27.892 |
| 0.253000000000078 | 0.616 | 6.441 | 27.995 |
| 0.256000000000078 | 0.622 | 6.476 | 28.098 |
| 0.259000000000078 | 0.628 | 6.51 | 28.202 |
| 0.262000000000078 | 0.634 | 6.545 | 28.306 |
| 0.265000000000078 | 0.64 | 6.58 | 28.41 |
| 0.268000000000078 | 0.646 | 6.615 | 28.515 |
| 0.271000000000078 | 0.652 | 6.65 | 28.62 |
| 0.274000000000078 | 0.659 | 6.685 | 28.725 |
| 0.277000000000078 | 0.665 | 6.72 | 28.83 |
| 0.280000000000078 | 0.671 | 6.756 | 28.936 |
| 0.283000000000078 | 0.677 | 6.791 | 29.042 |
| 0.286000000000078 | 0.684 | 6.827 | 29.148 |
| 0.289000000000078 | 0.69 | 6.863 | 29.255 |
| 0.292000000000078 | 0.697 | 6.899 | 29.362 |
| 0.295000000000078 | 0.703 | 6.935 | 29.469 |
| 0.298000000000078 | 0.71 | 6.972 | 29.576 |
| 0.301000000000078 | 0.716 | 7.008 | 29.684 |
| 0.304000000000078 | 0.723 | 7.045 | 29.792 |
| 0.307000000000078 | 0.73 | 7.082 | 29.9 |
| 0.310000000000078 | 0.736 | 7.118 | 30.009 |
| 0.313000000000078 | 0.743 | 7.156 | 30.118 |
| 0.316000000000078 | 0.75 | 7.193 | 30.227 |
| 0.319000000000078 | 0.757 | 7.23 | 30.337 |
| 0.322000000000078 | 0.764 | 7.268 | 30.447 |
| 0.325000000000078 | 0.771 | 7.305 | 30.557 |
| 0.328000000000078 | 0.778 | 7.343 | 30.667 |
| 0.331000000000078 | 0.785 | 7.381 | 30.778 |
| 0.334000000000078 | 0.792 | 7.419 | 30.889 |
| 0.337000000000078 | 0.799 | 7.457 | 31 |
| 0.340000000000078 | 0.806 | 7.496 | 31.112 |
| 0.343000000000078 | 0.813 | 7.534 | 31.224 |
| 0.346000000000078 | 0.821 | 7.573 | 31.336 |
| 0.349000000000078 | 0.828 | 7.612 | 31.449 |
| 0.352000000000078 | 0.835 | 7.65 | 31.561 |
| 0.355000000000078 | 0.843 | 7.69 | 31.675 |
| 0.358000000000078 | 0.85 | 7.729 | 31.788 |
| 0.361000000000078 | 0.858 | 7.768 | 31.902 |
| 0.364000000000078 | 0.865 | 7.808 | 32.016 |
| 0.367000000000078 | 0.873 | 7.848 | 32.13 |
| 0.370000000000078 | 0.881 | 7.887 | 32.245 |
| 0.373000000000078 | 0.888 | 7.927 | 32.36 |
| 0.376000000000078 | 0.896 | 7.968 | 32.475 |
| 0.379000000000078 | 0.904 | 8.008 | 32.591 |
| 0.382000000000078 | 0.912 | 8.048 | 32.707 |
| 0.385000000000078 | 0.92 | 8.089 | 32.823 |
| 0.388000000000078 | 0.928 | 8.13 | 32.939 |
| 0.391000000000078 | 0.936 | 8.171 | 33.056 |
| 0.394000000000078 | 0.944 | 8.212 | 33.173 |
| 0.397000000000078 | 0.952 | 8.253 | 33.291 |
| 0.400000000000078 | 0.96 | 8.294 | 33.408 |
| 0.403000000000078 | 0.969 | 8.336 | 33.526 |
| 0.406000000000078 | 0.977 | 8.378 | 33.645 |
| 0.409000000000078 | 0.985 | 8.42 | 33.764 |
| 0.412000000000079 | 0.994 | 8.462 | 33.883 |
| 0.415000000000079 | 1.002 | 8.504 | 34.002 |
| 0.418000000000079 | 1.011 | 8.546 | 34.122 |
| 0.421000000000079 | 1.019 | 8.589 | 34.241 |
| 0.424000000000079 | 1.028 | 8.631 | 34.362 |
| 0.427000000000079 | 1.037 | 8.674 | 34.482 |
| 0.430000000000079 | 1.045 | 8.717 | 34.603 |
| 0.433000000000079 | 1.054 | 8.76 | 34.724 |
| 0.436000000000079 | 1.063 | 8.803 | 34.846 |
| 0.439000000000079 | 1.072 | 8.847 | 34.968 |
| 0.442000000000079 | 1.081 | 8.89 | 35.09 |
| 0.445000000000079 | 1.09 | 8.934 | 35.213 |
| 0.448000000000079 | 1.099 | 8.978 | 35.335 |
| 0.451000000000079 | 1.108 | 9.022 | 35.458 |
| 0.454000000000079 | 1.117 | 9.066 | 35.582 |
| 0.457000000000079 | 1.127 | 9.111 | 35.706 |
| 0.460000000000079 | 1.136 | 9.155 | 35.83 |
| 0.463000000000079 | 1.145 | 9.2 | 35.954 |
| 0.466000000000079 | 1.155 | 9.245 | 36.079 |
| 0.469000000000079 | 1.164 | 9.29 | 36.204 |
| 0.472000000000079 | 1.174 | 9.335 | 36.329 |
| 0.475000000000079 | 1.183 | 9.381 | 36.455 |
| 0.478000000000079 | 1.193 | 9.426 | 36.581 |
| 0.481000000000079 | 1.203 | 9.472 | 36.708 |
| 0.484000000000079 | 1.212 | 9.518 | 36.834 |
| 0.487000000000079 | 1.222 | 9.564 | 36.961 |
| 0.490000000000079 | 1.232 | 9.61 | 37.089 |
| 0.493000000000079 | 1.242 | 9.657 | 37.216 |
| 0.496000000000079 | 1.252 | 9.703 | 37.344 |
| 0.499000000000079 | 1.262 | 9.75 | 37.473 |
| 0.502000000000079 | 1.272 | 9.797 | 37.601 |
| 0.505000000000079 | 1.283 | 9.844 | 37.73 |
| 0.508000000000079 | 1.293 | 9.891 | 37.86 |
| 0.511000000000079 | 1.303 | 9.939 | 37.989 |
| 0.514000000000079 | 1.314 | 9.986 | 38.119 |
| 0.517000000000079 | 1.324 | 10.034 | 38.25 |
| 0.520000000000079 | 1.334 | 10.082 | 38.381 |
| 0.523000000000079 | 1.345 | 10.13 | 38.512 |
| 0.526000000000079 | 1.356 | 10.178 | 38.643 |
| 0.529000000000079 | 1.366 | 10.227 | 38.775 |
| 0.532000000000079 | 1.377 | 10.275 | 38.907 |
| 0.535000000000079 | 1.388 | 10.324 | 39.039 |
| 0.538000000000079 | 1.399 | 10.373 | 39.172 |
| 0.541000000000079 | 1.41 | 10.422 | 39.305 |
| 0.544000000000079 | 1.421 | 10.471 | 39.438 |
| 0.547000000000079 | 1.432 | 10.521 | 39.572 |
| 0.550000000000079 | 1.443 | 10.571 | 39.706 |
| 0.553000000000079 | 1.454 | 10.62 | 39.84 |
| 0.556000000000079 | 1.465 | 10.67 | 39.975 |
| 0.559000000000079 | 1.477 | 10.721 | 40.11 |
| 0.562000000000079 | 1.488 | 10.771 | 40.245 |
| 0.565000000000079 | 1.5 | 10.822 | 40.381 |
| 0.568000000000079 | 1.511 | 10.872 | 40.517 |
| 0.571000000000079 | 1.523 | 10.923 | 40.654 |
| 0.574000000000079 | 1.534 | 10.974 | 40.79 |
| 0.577000000000079 | 1.546 | 11.025 | 40.928 |
| 0.580000000000079 | 1.558 | 11.077 | 41.065 |
| 0.583000000000079 | 1.57 | 11.129 | 41.203 |
| 0.586000000000079 | 1.582 | 11.18 | 41.341 |
| 0.589000000000079 | 1.594 | 11.232 | 41.48 |
| 0.592000000000079 | 1.606 | 11.284 | 41.618 |
| 0.595000000000079 | 1.618 | 11.337 | 41.758 |
| 0.598000000000079 | 1.63 | 11.389 | 41.897 |
| 0.601000000000079 | 1.642 | 11.442 | 42.037 |
| 0.604000000000079 | 1.655 | 11.495 | 42.177 |
| 0.607000000000079 | 1.667 | 11.548 | 42.318 |
| 0.610000000000079 | 1.68 | 11.601 | 42.459 |
| 0.613000000000079 | 1.692 | 11.655 | 42.6 |
| 0.616000000000079 | 1.705 | 11.708 | 42.742 |
| 0.619000000000079 | 1.718 | 11.762 | 42.884 |
| 0.622000000000079 | 1.73 | 11.816 | 43.026 |
| 0.625000000000079 | 1.743 | 11.87 | 43.169 |
| 0.628000000000079 | 1.756 | 11.925 | 43.312 |
| 0.631000000000079 | 1.769 | 11.979 | 43.456 |
| 0.634000000000079 | 1.782 | 12.034 | 43.599 |
| 0.637000000000079 | 1.795 | 12.089 | 43.743 |
| 0.640000000000079 | 1.808 | 12.144 | 43.888 |
| 0.643000000000079 | 1.822 | 12.199 | 44.033 |
| 0.646000000000079 | 1.835 | 12.255 | 44.178 |
| 0.649000000000079 | 1.849 | 12.31 | 44.324 |
| 0.652000000000079 | 1.862 | 12.366 | 44.47 |
| 0.655000000000079 | 1.876 | 12.422 | 44.616 |
| 0.658000000000079 | 1.889 | 12.478 | 44.763 |
| 0.661000000000079 | 1.903 | 12.535 | 44.91 |
| 0.664000000000079 | 1.917 | 12.591 | 45.057 |
| 0.667000000000079 | 1.931 | 12.648 | 45.205 |
| 0.670000000000079 | 1.944 | 12.705 | 45.353 |
| 0.673000000000079 | 1.959 | 12.763 | 45.501 |
| 0.676000000000079 | 1.973 | 12.82 | 45.65 |
| 0.679000000000079 | 1.987 | 12.877 | 45.799 |
| 0.682000000000079 | 2.001 | 12.935 | 45.949 |
| 0.685000000000079 | 2.015 | 12.993 | 46.099 |
| 0.688000000000079 | 2.03 | 13.051 | 46.249 |
| 0.691000000000079 | 2.044 | 13.11 | 46.4 |
| 0.694000000000079 | 2.059 | 13.168 | 46.551 |
| 0.697000000000079 | 2.073 | 13.227 | 46.702 |
| 0.700000000000079 | 2.088 | 13.286 | 46.854 |
| 0.703000000000079 | 2.103 | 13.345 | 47.006 |
| 0.706000000000079 | 2.118 | 13.405 | 47.159 |
| 0.709000000000079 | 2.133 | 13.464 | 47.312 |
| 0.712000000000079 | 2.148 | 13.524 | 47.465 |
| 0.715000000000079 | 2.163 | 13.584 | 47.618 |
| 0.718000000000079 | 2.178 | 13.644 | 47.772 |
| 0.721000000000079 | 2.193 | 13.704 | 47.927 |
| 0.724000000000079 | 2.208 | 13.765 | 48.082 |
| 0.727000000000079 | 2.224 | 13.825 | 48.237 |
| 0.730000000000079 | 2.239 | 13.886 | 48.392 |
| 0.733000000000079 | 2.255 | 13.948 | 48.548 |
| 0.736000000000079 | 2.271 | 14.009 | 48.704 |
| 0.739000000000079 | 2.286 | 14.07 | 48.861 |
| 0.742000000000079 | 2.302 | 14.132 | 49.018 |
| 0.745000000000079 | 2.318 | 14.194 | 49.175 |
| 0.748000000000079 | 2.334 | 14.256 | 49.333 |
| 0.751000000000079 | 2.35 | 14.319 | 49.491 |
| 0.754000000000079 | 2.366 | 14.381 | 49.65 |
| 0.757000000000079 | 2.382 | 14.444 | 49.809 |
| 0.760000000000079 | 2.399 | 14.507 | 49.968 |
| 0.763000000000079 | 2.415 | 14.57 | 50.128 |
| 0.766000000000079 | 2.432 | 14.634 | 50.288 |
| 0.769000000000079 | 2.448 | 14.697 | 50.448 |
| 0.772000000000079 | 2.465 | 14.761 | 50.609 |
| 0.775000000000079 | 2.482 | 14.825 | 50.77 |
| 0.778000000000079 | 2.498 | 14.889 | 50.932 |
| 0.781000000000079 | 2.515 | 14.954 | 51.094 |
| 0.784000000000079 | 2.532 | 15.018 | 51.256 |
| 0.787000000000079 | 2.549 | 15.083 | 51.419 |
| 0.790000000000079 | 2.567 | 15.148 | 51.582 |
| 0.793000000000079 | 2.584 | 15.213 | 51.745 |
| 0.796000000000079 | 2.601 | 15.279 | 51.909 |
| 0.799000000000079 | 2.619 | 15.344 | 52.074 |
| 0.802000000000079 | 2.636 | 15.41 | 52.238 |
| 0.805000000000079 | 2.654 | 15.476 | 52.403 |
| 0.808000000000079 | 2.671 | 15.543 | 52.569 |
| 0.811000000000079 | 2.689 | 15.609 | 52.735 |
| 0.814000000000079 | 2.707 | 15.676 | 52.901 |
| 0.817000000000079 | 2.725 | 15.743 | 53.068 |
| 0.820000000000079 | 2.743 | 15.81 | 53.235 |
| 0.823000000000079 | 2.761 | 15.878 | 53.402 |
| 0.826000000000079 | 2.779 | 15.945 | 53.57 |
| 0.829000000000079 | 2.798 | 16.013 | 53.738 |
| 0.832000000000079 | 2.816 | 16.081 | 53.907 |
| 0.835000000000079 | 2.835 | 16.149 | 54.076 |
| 0.838000000000079 | 2.853 | 16.218 | 54.245 |
| 0.841000000000079 | 2.872 | 16.286 | 54.415 |
| 0.844000000000079 | 2.891 | 16.355 | 54.585 |
| 0.847000000000079 | 2.909 | 16.424 | 54.756 |
| 0.850000000000079 | 2.928 | 16.494 | 54.927 |
| 0.853000000000079 | 2.947 | 16.563 | 55.098 |
| 0.856000000000079 | 2.967 | 16.633 | 55.27 |
| 0.859000000000079 | 2.986 | 16.703 | 55.442 |
| 0.862000000000079 | 3.005 | 16.773 | 55.615 |
| 0.865000000000079 | 3.025 | 16.844 | 55.788 |
| 0.868000000000079 | 3.044 | 16.914 | 55.961 |
| 0.871000000000079 | 3.064 | 16.985 | 56.135 |
| 0.874000000000079 | 3.083 | 17.056 | 56.309 |
| 0.877000000000079 | 3.103 | 17.128 | 56.484 |
| 0.880000000000079 | 3.123 | 17.199 | 56.659 |
| 0.883000000000079 | 3.143 | 17.271 | 56.834 |
| 0.886000000000079 | 3.163 | 17.343 | 57.01 |
| 0.889000000000079 | 3.183 | 17.415 | 57.186 |
| 0.892000000000079 | 3.203 | 17.488 | 57.363 |
| 0.895000000000079 | 3.224 | 17.56 | 57.54 |
| 0.898000000000079 | 3.244 | 17.633 | 57.717 |
| 0.901000000000079 | 3.265 | 17.706 | 57.895 |
| 0.904000000000079 | 3.286 | 17.78 | 58.074 |
| 0.907000000000079 | 3.306 | 17.853 | 58.252 |
| 0.910000000000079 | 3.327 | 17.927 | 58.432 |
| 0.913000000000079 | 3.348 | 18.001 | 58.611 |
| 0.916000000000079 | 3.369 | 18.075 | 58.791 |
| 0.919000000000079 | 3.39 | 18.15 | 58.971 |
| 0.922000000000079 | 3.412 | 18.225 | 59.152 |
| 0.925000000000079 | 3.433 | 18.3 | 59.333 |
| 0.928000000000079 | 3.454 | 18.375 | 59.515 |
| 0.931000000000079 | 3.476 | 18.45 | 59.697 |
| 0.934000000000079 | 3.498 | 18.526 | 59.879 |
| 0.937000000000079 | 3.519 | 18.602 | 60.062 |
| 0.940000000000079 | 3.541 | 18.678 | 60.246 |
| 0.943000000000079 | 3.563 | 18.754 | 60.429 |
| 0.946000000000079 | 3.585 | 18.831 | 60.613 |
| 0.949000000000079 | 3.607 | 18.908 | 60.798 |
| 0.952000000000079 | 3.63 | 18.985 | 60.983 |
| 0.955000000000079 | 3.652 | 19.062 | 61.168 |
| 0.958000000000079 | 3.674 | 19.14 | 61.354 |
| 0.961000000000079 | 3.697 | 19.217 | 61.54 |
| 0.964000000000079 | 3.72 | 19.295 | 61.727 |
| 0.967000000000079 | 3.742 | 19.374 | 61.914 |
| 0.970000000000079 | 3.765 | 19.452 | 62.101 |
| 0.973000000000079 | 3.788 | 19.531 | 62.289 |
| 0.976000000000079 | 3.811 | 19.61 | 62.478 |
| 0.979000000000079 | 3.835 | 19.689 | 62.667 |
| 0.982000000000079 | 3.858 | 19.768 | 62.856 |
| 0.985000000000079 | 3.881 | 19.848 | 63.045 |
| 0.988000000000079 | 3.905 | 19.928 | 63.235 |
| 0.991000000000079 | 3.928 | 20.008 | 63.426 |
| 0.994000000000079 | 3.952 | 20.088 | 63.617 |
| 0.997000000000079 | 3.976 | 20.169 | 63.808 |
| 1.00000000000008 | 4 | 20.25 | 64 |